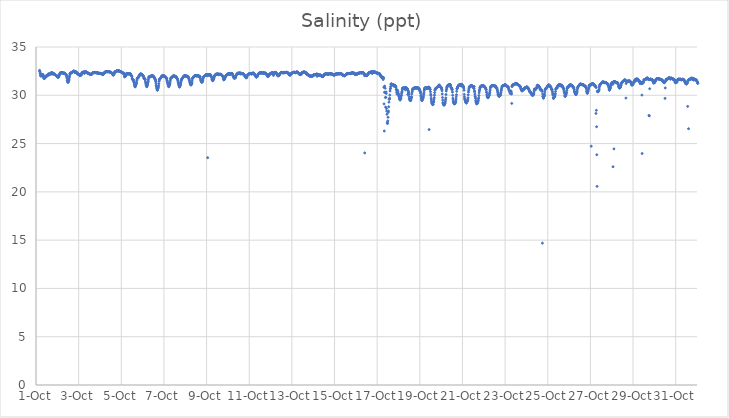
| Category | Salinity (ppt) |
|---|---|
| 44835.166666666664 | 32.58 |
| 44835.177083333336 | 32.49 |
| 44835.1875 | 32.41 |
| 44835.197916666664 | 32.23 |
| 44835.208333333336 | 32.07 |
| 44835.21875 | 32.02 |
| 44835.229166666664 | 32 |
| 44835.239583333336 | 32.01 |
| 44835.25 | 32.21 |
| 44835.260416666664 | 32.12 |
| 44835.270833333336 | 32 |
| 44835.28125 | 32.09 |
| 44835.291666666664 | 32.06 |
| 44835.302083333336 | 32.12 |
| 44835.3125 | 32.13 |
| 44835.322916666664 | 32.15 |
| 44835.333333333336 | 32.03 |
| 44835.34375 | 32.04 |
| 44835.354166666664 | 31.89 |
| 44835.364583333336 | 31.79 |
| 44835.375 | 31.74 |
| 44835.385416666664 | 31.87 |
| 44835.395833333336 | 31.84 |
| 44835.40625 | 31.77 |
| 44835.416666666664 | 31.77 |
| 44835.427083333336 | 31.86 |
| 44835.4375 | 31.91 |
| 44835.447916666664 | 31.94 |
| 44835.458333333336 | 31.96 |
| 44835.46875 | 32 |
| 44835.479166666664 | 31.99 |
| 44835.489583333336 | 32 |
| 44835.5 | 32 |
| 44835.510416666664 | 32.01 |
| 44835.520833333336 | 32.01 |
| 44835.53125 | 32.02 |
| 44835.541666666664 | 32.06 |
| 44835.552083333336 | 32.11 |
| 44835.5625 | 32.16 |
| 44835.572916666664 | 32.2 |
| 44835.583333333336 | 32.2 |
| 44835.59375 | 32.19 |
| 44835.604166666664 | 32.15 |
| 44835.614583333336 | 32.11 |
| 44835.625 | 32.14 |
| 44835.635416666664 | 32.16 |
| 44835.645833333336 | 32.18 |
| 44835.65625 | 32.2 |
| 44835.666666666664 | 32.24 |
| 44835.677083333336 | 32.25 |
| 44835.6875 | 32.28 |
| 44835.697916666664 | 32.29 |
| 44835.708333333336 | 32.31 |
| 44835.71875 | 32.31 |
| 44835.729166666664 | 32.33 |
| 44835.739583333336 | 32.33 |
| 44835.75 | 32.19 |
| 44835.760416666664 | 32.21 |
| 44835.770833333336 | 32.33 |
| 44835.78125 | 32.32 |
| 44835.791666666664 | 32.23 |
| 44835.802083333336 | 32.24 |
| 44835.8125 | 32.24 |
| 44835.822916666664 | 32.23 |
| 44835.833333333336 | 32.21 |
| 44835.84375 | 32.19 |
| 44835.854166666664 | 32.21 |
| 44835.864583333336 | 32.19 |
| 44835.875 | 32.19 |
| 44835.885416666664 | 32.16 |
| 44835.895833333336 | 32.13 |
| 44835.90625 | 32.12 |
| 44835.916666666664 | 32.09 |
| 44835.927083333336 | 32.08 |
| 44835.9375 | 32.07 |
| 44835.947916666664 | 32.04 |
| 44835.958333333336 | 32.03 |
| 44835.96875 | 32.03 |
| 44835.979166666664 | 32.02 |
| 44835.989583333336 | 31.98 |
| 44836.0 | 31.93 |
| 44836.010416666664 | 31.91 |
| 44836.020833333336 | 31.89 |
| 44836.03125 | 31.83 |
| 44836.041666666664 | 31.92 |
| 44836.052083333336 | 31.92 |
| 44836.0625 | 31.92 |
| 44836.072916666664 | 31.98 |
| 44836.083333333336 | 32.04 |
| 44836.09375 | 32.09 |
| 44836.104166666664 | 32.15 |
| 44836.114583333336 | 32.24 |
| 44836.125 | 32.29 |
| 44836.135416666664 | 32.3 |
| 44836.145833333336 | 32.33 |
| 44836.15625 | 32.33 |
| 44836.166666666664 | 32.33 |
| 44836.177083333336 | 32.33 |
| 44836.1875 | 32.33 |
| 44836.197916666664 | 32.32 |
| 44836.208333333336 | 32.32 |
| 44836.21875 | 32.33 |
| 44836.229166666664 | 32.33 |
| 44836.239583333336 | 32.33 |
| 44836.25 | 32.32 |
| 44836.260416666664 | 32.3 |
| 44836.270833333336 | 32.31 |
| 44836.28125 | 32.3 |
| 44836.291666666664 | 32.3 |
| 44836.302083333336 | 32.3 |
| 44836.3125 | 32.28 |
| 44836.322916666664 | 32.28 |
| 44836.333333333336 | 32.3 |
| 44836.34375 | 32.27 |
| 44836.354166666664 | 32.25 |
| 44836.364583333336 | 32.24 |
| 44836.375 | 32.23 |
| 44836.385416666664 | 32.17 |
| 44836.395833333336 | 32.17 |
| 44836.40625 | 32.14 |
| 44836.416666666664 | 32.11 |
| 44836.427083333336 | 32.03 |
| 44836.4375 | 31.97 |
| 44836.447916666664 | 31.86 |
| 44836.458333333336 | 31.72 |
| 44836.46875 | 31.53 |
| 44836.479166666664 | 31.45 |
| 44836.489583333336 | 31.36 |
| 44836.5 | 31.34 |
| 44836.510416666664 | 31.36 |
| 44836.520833333336 | 31.44 |
| 44836.53125 | 31.49 |
| 44836.541666666664 | 31.55 |
| 44836.552083333336 | 31.67 |
| 44836.5625 | 31.83 |
| 44836.572916666664 | 31.97 |
| 44836.583333333336 | 32.1 |
| 44836.59375 | 32.27 |
| 44836.604166666664 | 32.26 |
| 44836.614583333336 | 32.28 |
| 44836.625 | 32.3 |
| 44836.635416666664 | 32.31 |
| 44836.645833333336 | 32.32 |
| 44836.65625 | 32.33 |
| 44836.666666666664 | 32.33 |
| 44836.677083333336 | 32.34 |
| 44836.6875 | 32.36 |
| 44836.697916666664 | 32.38 |
| 44836.708333333336 | 32.41 |
| 44836.71875 | 32.45 |
| 44836.729166666664 | 32.46 |
| 44836.739583333336 | 32.46 |
| 44836.75 | 32.48 |
| 44836.760416666664 | 32.5 |
| 44836.770833333336 | 32.5 |
| 44836.78125 | 32.5 |
| 44836.791666666664 | 32.5 |
| 44836.802083333336 | 32.38 |
| 44836.8125 | 32.38 |
| 44836.822916666664 | 32.4 |
| 44836.833333333336 | 32.43 |
| 44836.84375 | 32.42 |
| 44836.854166666664 | 32.41 |
| 44836.864583333336 | 32.41 |
| 44836.875 | 32.42 |
| 44836.885416666664 | 32.42 |
| 44836.895833333336 | 32.36 |
| 44836.90625 | 32.34 |
| 44836.916666666664 | 32.31 |
| 44836.927083333336 | 32.28 |
| 44836.9375 | 32.25 |
| 44836.947916666664 | 32.21 |
| 44836.958333333336 | 32.21 |
| 44836.96875 | 32.2 |
| 44836.979166666664 | 32.18 |
| 44836.989583333336 | 32.2 |
| 44837.0 | 32.19 |
| 44837.010416666664 | 32.16 |
| 44837.020833333336 | 32.15 |
| 44837.03125 | 32.13 |
| 44837.041666666664 | 32.13 |
| 44837.052083333336 | 32.04 |
| 44837.0625 | 32.03 |
| 44837.072916666664 | 32.05 |
| 44837.083333333336 | 32.1 |
| 44837.09375 | 32.09 |
| 44837.104166666664 | 32.1 |
| 44837.114583333336 | 32.09 |
| 44837.125 | 32.13 |
| 44837.135416666664 | 32.18 |
| 44837.145833333336 | 32.26 |
| 44837.15625 | 32.33 |
| 44837.166666666664 | 32.35 |
| 44837.177083333336 | 32.36 |
| 44837.1875 | 32.37 |
| 44837.197916666664 | 32.39 |
| 44837.208333333336 | 32.38 |
| 44837.21875 | 32.38 |
| 44837.229166666664 | 32.38 |
| 44837.239583333336 | 32.4 |
| 44837.25 | 32.4 |
| 44837.260416666664 | 32.41 |
| 44837.270833333336 | 32.26 |
| 44837.28125 | 32.42 |
| 44837.291666666664 | 32.43 |
| 44837.302083333336 | 32.44 |
| 44837.3125 | 32.4 |
| 44837.322916666664 | 32.41 |
| 44837.333333333336 | 32.42 |
| 44837.34375 | 32.42 |
| 44837.354166666664 | 32.42 |
| 44837.364583333336 | 32.41 |
| 44837.375 | 32.38 |
| 44837.385416666664 | 32.36 |
| 44837.395833333336 | 32.33 |
| 44837.40625 | 32.32 |
| 44837.416666666664 | 32.31 |
| 44837.427083333336 | 32.3 |
| 44837.4375 | 32.3 |
| 44837.447916666664 | 32.29 |
| 44837.458333333336 | 32.28 |
| 44837.46875 | 32.25 |
| 44837.479166666664 | 32.24 |
| 44837.489583333336 | 32.25 |
| 44837.5 | 32.23 |
| 44837.510416666664 | 32.22 |
| 44837.520833333336 | 32.22 |
| 44837.53125 | 32.21 |
| 44837.541666666664 | 32.16 |
| 44837.552083333336 | 32.16 |
| 44837.5625 | 32.16 |
| 44837.572916666664 | 32.17 |
| 44837.583333333336 | 32.17 |
| 44837.59375 | 32.17 |
| 44837.604166666664 | 32.16 |
| 44837.614583333336 | 32.18 |
| 44837.625 | 32.22 |
| 44837.635416666664 | 32.25 |
| 44837.645833333336 | 32.28 |
| 44837.65625 | 32.31 |
| 44837.666666666664 | 32.33 |
| 44837.677083333336 | 32.34 |
| 44837.6875 | 32.34 |
| 44837.697916666664 | 32.35 |
| 44837.708333333336 | 32.35 |
| 44837.71875 | 32.35 |
| 44837.729166666664 | 32.36 |
| 44837.739583333336 | 32.35 |
| 44837.75 | 32.35 |
| 44837.760416666664 | 32.35 |
| 44837.770833333336 | 32.35 |
| 44837.78125 | 32.35 |
| 44837.791666666664 | 32.35 |
| 44837.802083333336 | 32.35 |
| 44837.8125 | 32.35 |
| 44837.822916666664 | 32.33 |
| 44837.833333333336 | 32.33 |
| 44837.84375 | 32.34 |
| 44837.854166666664 | 32.34 |
| 44837.864583333336 | 32.34 |
| 44837.875 | 32.33 |
| 44837.885416666664 | 32.31 |
| 44837.895833333336 | 32.3 |
| 44837.90625 | 32.29 |
| 44837.916666666664 | 32.29 |
| 44837.927083333336 | 32.28 |
| 44837.9375 | 32.29 |
| 44837.947916666664 | 32.28 |
| 44837.958333333336 | 32.27 |
| 44837.96875 | 32.28 |
| 44837.979166666664 | 32.27 |
| 44837.989583333336 | 32.26 |
| 44838.0 | 32.25 |
| 44838.010416666664 | 32.26 |
| 44838.020833333336 | 32.26 |
| 44838.03125 | 32.26 |
| 44838.041666666664 | 32.25 |
| 44838.052083333336 | 32.26 |
| 44838.0625 | 32.25 |
| 44838.072916666664 | 32.26 |
| 44838.083333333336 | 32.23 |
| 44838.09375 | 32.21 |
| 44838.104166666664 | 32.22 |
| 44838.114583333336 | 32.17 |
| 44838.125 | 32.14 |
| 44838.135416666664 | 32.14 |
| 44838.145833333336 | 32.18 |
| 44838.15625 | 32.17 |
| 44838.166666666664 | 32.19 |
| 44838.177083333336 | 32.22 |
| 44838.1875 | 32.27 |
| 44838.197916666664 | 32.32 |
| 44838.208333333336 | 32.34 |
| 44838.21875 | 32.38 |
| 44838.229166666664 | 32.38 |
| 44838.239583333336 | 32.41 |
| 44838.25 | 32.42 |
| 44838.260416666664 | 32.42 |
| 44838.270833333336 | 32.43 |
| 44838.28125 | 32.44 |
| 44838.291666666664 | 32.44 |
| 44838.302083333336 | 32.45 |
| 44838.3125 | 32.45 |
| 44838.322916666664 | 32.46 |
| 44838.333333333336 | 32.45 |
| 44838.34375 | 32.45 |
| 44838.354166666664 | 32.45 |
| 44838.364583333336 | 32.43 |
| 44838.375 | 32.44 |
| 44838.385416666664 | 32.45 |
| 44838.395833333336 | 32.45 |
| 44838.40625 | 32.45 |
| 44838.416666666664 | 32.44 |
| 44838.427083333336 | 32.44 |
| 44838.4375 | 32.43 |
| 44838.447916666664 | 32.43 |
| 44838.458333333336 | 32.43 |
| 44838.46875 | 32.42 |
| 44838.479166666664 | 32.39 |
| 44838.489583333336 | 32.38 |
| 44838.5 | 32.39 |
| 44838.510416666664 | 32.34 |
| 44838.520833333336 | 32.37 |
| 44838.53125 | 32.33 |
| 44838.541666666664 | 32.32 |
| 44838.552083333336 | 32.29 |
| 44838.5625 | 32.29 |
| 44838.572916666664 | 32.26 |
| 44838.583333333336 | 32.24 |
| 44838.59375 | 32.23 |
| 44838.604166666664 | 32.18 |
| 44838.614583333336 | 32.11 |
| 44838.625 | 32.07 |
| 44838.635416666664 | 32.18 |
| 44838.645833333336 | 32.16 |
| 44838.65625 | 32.19 |
| 44838.666666666664 | 32.25 |
| 44838.677083333336 | 32.28 |
| 44838.6875 | 32.38 |
| 44838.697916666664 | 32.44 |
| 44838.708333333336 | 32.45 |
| 44838.71875 | 32.45 |
| 44838.729166666664 | 32.46 |
| 44838.739583333336 | 32.46 |
| 44838.75 | 32.48 |
| 44838.760416666664 | 32.49 |
| 44838.770833333336 | 32.51 |
| 44838.78125 | 32.52 |
| 44838.791666666664 | 32.52 |
| 44838.802083333336 | 32.53 |
| 44838.8125 | 32.53 |
| 44838.822916666664 | 32.53 |
| 44838.833333333336 | 32.53 |
| 44838.84375 | 32.53 |
| 44838.854166666664 | 32.52 |
| 44838.864583333336 | 32.52 |
| 44838.875 | 32.52 |
| 44838.885416666664 | 32.53 |
| 44838.895833333336 | 32.52 |
| 44838.90625 | 32.5 |
| 44838.916666666664 | 32.5 |
| 44838.927083333336 | 32.5 |
| 44838.9375 | 32.48 |
| 44838.947916666664 | 32.46 |
| 44838.958333333336 | 32.44 |
| 44838.96875 | 32.44 |
| 44838.979166666664 | 32.44 |
| 44838.989583333336 | 32.44 |
| 44839.0 | 32.44 |
| 44839.010416666664 | 32.41 |
| 44839.020833333336 | 32.39 |
| 44839.03125 | 32.36 |
| 44839.041666666664 | 32.34 |
| 44839.052083333336 | 32.34 |
| 44839.0625 | 32.33 |
| 44839.072916666664 | 32.31 |
| 44839.083333333336 | 32.3 |
| 44839.09375 | 32.29 |
| 44839.104166666664 | 32.27 |
| 44839.114583333336 | 32.25 |
| 44839.125 | 32.27 |
| 44839.135416666664 | 32.19 |
| 44839.145833333336 | 32.02 |
| 44839.15625 | 31.91 |
| 44839.166666666664 | 31.91 |
| 44839.177083333336 | 31.95 |
| 44839.1875 | 31.98 |
| 44839.197916666664 | 31.98 |
| 44839.208333333336 | 32.03 |
| 44839.21875 | 32.07 |
| 44839.229166666664 | 32.17 |
| 44839.239583333336 | 32.22 |
| 44839.25 | 32.26 |
| 44839.260416666664 | 32.27 |
| 44839.270833333336 | 32.26 |
| 44839.28125 | 32.24 |
| 44839.291666666664 | 32.23 |
| 44839.302083333336 | 32.22 |
| 44839.3125 | 32.22 |
| 44839.322916666664 | 32.22 |
| 44839.333333333336 | 32.22 |
| 44839.34375 | 32.23 |
| 44839.354166666664 | 32.23 |
| 44839.364583333336 | 32.24 |
| 44839.375 | 32.24 |
| 44839.385416666664 | 32.24 |
| 44839.395833333336 | 32.23 |
| 44839.40625 | 32.21 |
| 44839.416666666664 | 32.23 |
| 44839.427083333336 | 32.23 |
| 44839.4375 | 32.17 |
| 44839.447916666664 | 32.1 |
| 44839.458333333336 | 32.08 |
| 44839.46875 | 32.04 |
| 44839.479166666664 | 32.03 |
| 44839.489583333336 | 32 |
| 44839.5 | 31.94 |
| 44839.510416666664 | 31.73 |
| 44839.520833333336 | 31.69 |
| 44839.53125 | 31.63 |
| 44839.541666666664 | 31.62 |
| 44839.552083333336 | 31.62 |
| 44839.5625 | 31.6 |
| 44839.572916666664 | 31.54 |
| 44839.583333333336 | 31.45 |
| 44839.59375 | 31.36 |
| 44839.604166666664 | 31.31 |
| 44839.614583333336 | 31.14 |
| 44839.625 | 31.02 |
| 44839.635416666664 | 30.93 |
| 44839.645833333336 | 30.87 |
| 44839.65625 | 30.89 |
| 44839.666666666664 | 31.02 |
| 44839.677083333336 | 31.08 |
| 44839.6875 | 31.1 |
| 44839.697916666664 | 31.16 |
| 44839.708333333336 | 31.24 |
| 44839.71875 | 31.37 |
| 44839.729166666664 | 31.56 |
| 44839.739583333336 | 31.7 |
| 44839.75 | 31.75 |
| 44839.760416666664 | 31.76 |
| 44839.770833333336 | 31.78 |
| 44839.78125 | 31.79 |
| 44839.791666666664 | 31.84 |
| 44839.802083333336 | 31.86 |
| 44839.8125 | 31.9 |
| 44839.822916666664 | 31.95 |
| 44839.833333333336 | 32.01 |
| 44839.84375 | 32.03 |
| 44839.854166666664 | 32.08 |
| 44839.864583333336 | 32.14 |
| 44839.875 | 32.17 |
| 44839.885416666664 | 32.19 |
| 44839.895833333336 | 32.2 |
| 44839.90625 | 32.21 |
| 44839.916666666664 | 32.21 |
| 44839.927083333336 | 32.21 |
| 44839.9375 | 32.18 |
| 44839.947916666664 | 32.12 |
| 44839.958333333336 | 32.16 |
| 44839.96875 | 32.12 |
| 44839.979166666664 | 32.1 |
| 44839.989583333336 | 32.08 |
| 44840.0 | 32.08 |
| 44840.010416666664 | 32.07 |
| 44840.020833333336 | 32.04 |
| 44840.03125 | 32.01 |
| 44840.041666666664 | 31.94 |
| 44840.052083333336 | 31.85 |
| 44840.0625 | 31.77 |
| 44840.072916666664 | 31.74 |
| 44840.083333333336 | 31.72 |
| 44840.09375 | 31.73 |
| 44840.104166666664 | 31.7 |
| 44840.114583333336 | 31.67 |
| 44840.125 | 31.6 |
| 44840.135416666664 | 31.4 |
| 44840.145833333336 | 31.27 |
| 44840.15625 | 31.16 |
| 44840.166666666664 | 31.06 |
| 44840.177083333336 | 30.97 |
| 44840.1875 | 30.9 |
| 44840.197916666664 | 30.89 |
| 44840.208333333336 | 30.99 |
| 44840.21875 | 31.05 |
| 44840.229166666664 | 31.09 |
| 44840.239583333336 | 31.17 |
| 44840.25 | 31.33 |
| 44840.260416666664 | 31.44 |
| 44840.270833333336 | 31.59 |
| 44840.28125 | 31.77 |
| 44840.291666666664 | 31.9 |
| 44840.302083333336 | 31.91 |
| 44840.3125 | 31.91 |
| 44840.322916666664 | 31.91 |
| 44840.333333333336 | 31.9 |
| 44840.34375 | 31.91 |
| 44840.354166666664 | 31.93 |
| 44840.364583333336 | 31.94 |
| 44840.375 | 31.96 |
| 44840.385416666664 | 31.97 |
| 44840.395833333336 | 31.99 |
| 44840.40625 | 32 |
| 44840.416666666664 | 32.02 |
| 44840.427083333336 | 32.04 |
| 44840.4375 | 32.06 |
| 44840.447916666664 | 32.05 |
| 44840.458333333336 | 31.98 |
| 44840.46875 | 32.03 |
| 44840.479166666664 | 32 |
| 44840.489583333336 | 31.97 |
| 44840.5 | 31.98 |
| 44840.510416666664 | 31.94 |
| 44840.520833333336 | 31.93 |
| 44840.53125 | 31.88 |
| 44840.541666666664 | 31.86 |
| 44840.552083333336 | 31.83 |
| 44840.5625 | 31.77 |
| 44840.572916666664 | 31.72 |
| 44840.583333333336 | 31.68 |
| 44840.59375 | 31.63 |
| 44840.604166666664 | 31.56 |
| 44840.614583333336 | 31.42 |
| 44840.625 | 31.24 |
| 44840.635416666664 | 31.04 |
| 44840.645833333336 | 30.88 |
| 44840.65625 | 30.89 |
| 44840.666666666664 | 30.69 |
| 44840.677083333336 | 30.64 |
| 44840.6875 | 30.53 |
| 44840.697916666664 | 30.53 |
| 44840.708333333336 | 30.67 |
| 44840.71875 | 30.73 |
| 44840.729166666664 | 30.77 |
| 44840.739583333336 | 30.87 |
| 44840.75 | 31 |
| 44840.760416666664 | 31.2 |
| 44840.770833333336 | 31.44 |
| 44840.78125 | 31.6 |
| 44840.791666666664 | 31.62 |
| 44840.802083333336 | 31.67 |
| 44840.8125 | 31.7 |
| 44840.822916666664 | 31.75 |
| 44840.833333333336 | 31.76 |
| 44840.84375 | 31.79 |
| 44840.854166666664 | 31.82 |
| 44840.864583333336 | 31.85 |
| 44840.875 | 31.89 |
| 44840.885416666664 | 31.94 |
| 44840.895833333336 | 31.97 |
| 44840.90625 | 31.99 |
| 44840.916666666664 | 32.01 |
| 44840.927083333336 | 32.02 |
| 44840.9375 | 32.04 |
| 44840.947916666664 | 32.04 |
| 44840.958333333336 | 32.04 |
| 44840.96875 | 32.05 |
| 44840.979166666664 | 32.03 |
| 44840.989583333336 | 31.99 |
| 44841.0 | 31.94 |
| 44841.010416666664 | 31.99 |
| 44841.020833333336 | 31.97 |
| 44841.03125 | 31.99 |
| 44841.041666666664 | 31.95 |
| 44841.052083333336 | 31.96 |
| 44841.0625 | 31.94 |
| 44841.072916666664 | 31.9 |
| 44841.083333333336 | 31.86 |
| 44841.09375 | 31.82 |
| 44841.104166666664 | 31.78 |
| 44841.114583333336 | 31.77 |
| 44841.125 | 31.75 |
| 44841.135416666664 | 31.69 |
| 44841.145833333336 | 31.54 |
| 44841.15625 | 31.45 |
| 44841.166666666664 | 31.35 |
| 44841.177083333336 | 31.24 |
| 44841.1875 | 31.15 |
| 44841.197916666664 | 31.07 |
| 44841.208333333336 | 30.98 |
| 44841.21875 | 30.9 |
| 44841.229166666664 | 30.89 |
| 44841.239583333336 | 30.98 |
| 44841.25 | 31.06 |
| 44841.260416666664 | 31.06 |
| 44841.270833333336 | 31.14 |
| 44841.28125 | 31.27 |
| 44841.291666666664 | 31.37 |
| 44841.302083333336 | 31.56 |
| 44841.3125 | 31.72 |
| 44841.322916666664 | 31.78 |
| 44841.333333333336 | 31.79 |
| 44841.34375 | 31.81 |
| 44841.354166666664 | 31.83 |
| 44841.364583333336 | 31.85 |
| 44841.375 | 31.87 |
| 44841.385416666664 | 31.89 |
| 44841.395833333336 | 31.92 |
| 44841.40625 | 31.94 |
| 44841.416666666664 | 31.97 |
| 44841.427083333336 | 31.99 |
| 44841.4375 | 32 |
| 44841.447916666664 | 32.01 |
| 44841.458333333336 | 32.02 |
| 44841.46875 | 32.02 |
| 44841.479166666664 | 31.98 |
| 44841.489583333336 | 31.97 |
| 44841.5 | 31.98 |
| 44841.510416666664 | 31.96 |
| 44841.520833333336 | 31.95 |
| 44841.53125 | 31.97 |
| 44841.541666666664 | 31.94 |
| 44841.552083333336 | 31.92 |
| 44841.5625 | 31.94 |
| 44841.572916666664 | 31.87 |
| 44841.583333333336 | 31.87 |
| 44841.59375 | 31.82 |
| 44841.604166666664 | 31.78 |
| 44841.614583333336 | 31.73 |
| 44841.625 | 31.71 |
| 44841.635416666664 | 31.68 |
| 44841.645833333336 | 31.58 |
| 44841.65625 | 31.49 |
| 44841.666666666664 | 31.36 |
| 44841.677083333336 | 31.31 |
| 44841.6875 | 31.16 |
| 44841.697916666664 | 31.08 |
| 44841.708333333336 | 31.01 |
| 44841.71875 | 30.94 |
| 44841.729166666664 | 30.84 |
| 44841.739583333336 | 30.91 |
| 44841.75 | 31.03 |
| 44841.760416666664 | 30.97 |
| 44841.770833333336 | 31.07 |
| 44841.78125 | 31.19 |
| 44841.791666666664 | 31.29 |
| 44841.802083333336 | 31.45 |
| 44841.8125 | 31.55 |
| 44841.822916666664 | 31.63 |
| 44841.833333333336 | 31.67 |
| 44841.84375 | 31.7 |
| 44841.854166666664 | 31.75 |
| 44841.864583333336 | 31.77 |
| 44841.875 | 31.79 |
| 44841.885416666664 | 31.83 |
| 44841.895833333336 | 31.85 |
| 44841.90625 | 31.9 |
| 44841.916666666664 | 31.93 |
| 44841.927083333336 | 31.97 |
| 44841.9375 | 31.99 |
| 44841.947916666664 | 32 |
| 44841.958333333336 | 32.01 |
| 44841.96875 | 32.02 |
| 44841.979166666664 | 32.03 |
| 44841.989583333336 | 32.04 |
| 44842.0 | 32.04 |
| 44842.010416666664 | 32 |
| 44842.020833333336 | 31.97 |
| 44842.03125 | 32 |
| 44842.041666666664 | 31.98 |
| 44842.052083333336 | 31.97 |
| 44842.0625 | 31.99 |
| 44842.072916666664 | 31.97 |
| 44842.083333333336 | 31.97 |
| 44842.09375 | 31.97 |
| 44842.104166666664 | 31.95 |
| 44842.114583333336 | 31.91 |
| 44842.125 | 31.89 |
| 44842.135416666664 | 31.88 |
| 44842.145833333336 | 31.89 |
| 44842.15625 | 31.83 |
| 44842.166666666664 | 31.78 |
| 44842.177083333336 | 31.71 |
| 44842.1875 | 31.62 |
| 44842.197916666664 | 31.52 |
| 44842.208333333336 | 31.42 |
| 44842.21875 | 31.34 |
| 44842.229166666664 | 31.24 |
| 44842.239583333336 | 31.16 |
| 44842.25 | 31.13 |
| 44842.260416666664 | 31.07 |
| 44842.270833333336 | 31.06 |
| 44842.28125 | 31.17 |
| 44842.291666666664 | 31.13 |
| 44842.302083333336 | 31.22 |
| 44842.3125 | 31.3 |
| 44842.322916666664 | 31.5 |
| 44842.333333333336 | 31.7 |
| 44842.34375 | 31.78 |
| 44842.354166666664 | 31.79 |
| 44842.364583333336 | 31.83 |
| 44842.375 | 31.85 |
| 44842.385416666664 | 31.88 |
| 44842.395833333336 | 31.91 |
| 44842.40625 | 31.94 |
| 44842.416666666664 | 31.97 |
| 44842.427083333336 | 31.99 |
| 44842.4375 | 32.01 |
| 44842.447916666664 | 32.02 |
| 44842.458333333336 | 32.03 |
| 44842.46875 | 32.04 |
| 44842.479166666664 | 32.04 |
| 44842.489583333336 | 32.04 |
| 44842.5 | 32.04 |
| 44842.510416666664 | 32.04 |
| 44842.520833333336 | 32.04 |
| 44842.53125 | 31.97 |
| 44842.541666666664 | 32.03 |
| 44842.552083333336 | 32.02 |
| 44842.5625 | 32.01 |
| 44842.572916666664 | 32.03 |
| 44842.583333333336 | 32.02 |
| 44842.59375 | 32.02 |
| 44842.604166666664 | 32.02 |
| 44842.614583333336 | 32.01 |
| 44842.625 | 32 |
| 44842.635416666664 | 31.98 |
| 44842.645833333336 | 31.96 |
| 44842.65625 | 31.97 |
| 44842.666666666664 | 31.97 |
| 44842.677083333336 | 31.91 |
| 44842.6875 | 31.94 |
| 44842.697916666664 | 31.91 |
| 44842.708333333336 | 31.75 |
| 44842.71875 | 31.68 |
| 44842.729166666664 | 31.56 |
| 44842.739583333336 | 31.5 |
| 44842.75 | 31.42 |
| 44842.760416666664 | 31.43 |
| 44842.770833333336 | 31.33 |
| 44842.78125 | 31.39 |
| 44842.791666666664 | 31.43 |
| 44842.802083333336 | 31.4 |
| 44842.8125 | 31.46 |
| 44842.822916666664 | 31.49 |
| 44842.833333333336 | 31.69 |
| 44842.84375 | 31.81 |
| 44842.854166666664 | 31.87 |
| 44842.864583333336 | 31.9 |
| 44842.875 | 31.93 |
| 44842.885416666664 | 31.96 |
| 44842.895833333336 | 31.97 |
| 44842.90625 | 32.01 |
| 44842.916666666664 | 32.04 |
| 44842.927083333336 | 32.05 |
| 44842.9375 | 32.08 |
| 44842.947916666664 | 32.09 |
| 44842.958333333336 | 32.1 |
| 44842.96875 | 32.11 |
| 44842.979166666664 | 32.11 |
| 44842.989583333336 | 32.11 |
| 44843.0 | 32.12 |
| 44843.010416666664 | 32.13 |
| 44843.020833333336 | 32.13 |
| 44843.03125 | 32.14 |
| 44843.041666666664 | 32.03 |
| 44843.052083333336 | 23.54 |
| 44843.0625 | 32.09 |
| 44843.072916666664 | 32.09 |
| 44843.083333333336 | 32.1 |
| 44843.09375 | 32.12 |
| 44843.104166666664 | 32.1 |
| 44843.114583333336 | 32.11 |
| 44843.125 | 32.13 |
| 44843.135416666664 | 32.1 |
| 44843.145833333336 | 32.13 |
| 44843.15625 | 32.14 |
| 44843.166666666664 | 32.14 |
| 44843.177083333336 | 32.13 |
| 44843.1875 | 32.12 |
| 44843.197916666664 | 32.05 |
| 44843.208333333336 | 31.97 |
| 44843.21875 | 31.94 |
| 44843.229166666664 | 31.86 |
| 44843.239583333336 | 31.87 |
| 44843.25 | 31.68 |
| 44843.260416666664 | 31.61 |
| 44843.270833333336 | 31.56 |
| 44843.28125 | 31.53 |
| 44843.291666666664 | 31.51 |
| 44843.302083333336 | 31.62 |
| 44843.3125 | 31.62 |
| 44843.322916666664 | 31.62 |
| 44843.333333333336 | 31.7 |
| 44843.34375 | 31.78 |
| 44843.354166666664 | 31.88 |
| 44843.364583333336 | 31.99 |
| 44843.375 | 32.03 |
| 44843.385416666664 | 32.06 |
| 44843.395833333336 | 32.09 |
| 44843.40625 | 32.1 |
| 44843.416666666664 | 32.13 |
| 44843.427083333336 | 32.15 |
| 44843.4375 | 32.18 |
| 44843.447916666664 | 32.19 |
| 44843.458333333336 | 32.19 |
| 44843.46875 | 32.19 |
| 44843.479166666664 | 32.18 |
| 44843.489583333336 | 32.18 |
| 44843.5 | 32.19 |
| 44843.510416666664 | 32.19 |
| 44843.520833333336 | 32.19 |
| 44843.53125 | 32.2 |
| 44843.541666666664 | 32.2 |
| 44843.552083333336 | 32.2 |
| 44843.5625 | 32.13 |
| 44843.572916666664 | 32.16 |
| 44843.583333333336 | 32.16 |
| 44843.59375 | 32.16 |
| 44843.604166666664 | 32.19 |
| 44843.614583333336 | 32.15 |
| 44843.625 | 32.16 |
| 44843.635416666664 | 32.18 |
| 44843.645833333336 | 32.18 |
| 44843.65625 | 32.16 |
| 44843.666666666664 | 32.14 |
| 44843.677083333336 | 32.16 |
| 44843.6875 | 32.13 |
| 44843.697916666664 | 32.12 |
| 44843.708333333336 | 32.12 |
| 44843.71875 | 32.07 |
| 44843.729166666664 | 32.05 |
| 44843.739583333336 | 32 |
| 44843.75 | 31.97 |
| 44843.760416666664 | 31.94 |
| 44843.770833333336 | 31.93 |
| 44843.78125 | 31.8 |
| 44843.791666666664 | 31.72 |
| 44843.802083333336 | 31.61 |
| 44843.8125 | 31.6 |
| 44843.822916666664 | 31.73 |
| 44843.833333333336 | 31.64 |
| 44843.84375 | 31.68 |
| 44843.854166666664 | 31.74 |
| 44843.864583333336 | 31.85 |
| 44843.875 | 31.91 |
| 44843.885416666664 | 31.95 |
| 44843.895833333336 | 31.97 |
| 44843.90625 | 32 |
| 44843.916666666664 | 32.04 |
| 44843.927083333336 | 32.06 |
| 44843.9375 | 32.09 |
| 44843.947916666664 | 32.11 |
| 44843.958333333336 | 32.14 |
| 44843.96875 | 32.17 |
| 44843.979166666664 | 32.18 |
| 44843.989583333336 | 32.19 |
| 44844.0 | 32.19 |
| 44844.010416666664 | 32.2 |
| 44844.020833333336 | 32.21 |
| 44844.03125 | 32.22 |
| 44844.041666666664 | 32.23 |
| 44844.052083333336 | 32.24 |
| 44844.0625 | 32.25 |
| 44844.072916666664 | 32.16 |
| 44844.083333333336 | 32.2 |
| 44844.09375 | 32.21 |
| 44844.104166666664 | 32.2 |
| 44844.114583333336 | 32.23 |
| 44844.125 | 32.2 |
| 44844.135416666664 | 32.21 |
| 44844.145833333336 | 32.24 |
| 44844.15625 | 32.24 |
| 44844.166666666664 | 32.27 |
| 44844.177083333336 | 32.25 |
| 44844.1875 | 32.22 |
| 44844.197916666664 | 32.25 |
| 44844.208333333336 | 32.24 |
| 44844.21875 | 32.17 |
| 44844.229166666664 | 32.09 |
| 44844.239583333336 | 32.04 |
| 44844.25 | 31.97 |
| 44844.260416666664 | 31.99 |
| 44844.270833333336 | 31.84 |
| 44844.28125 | 31.85 |
| 44844.291666666664 | 31.79 |
| 44844.302083333336 | 31.76 |
| 44844.3125 | 31.77 |
| 44844.322916666664 | 31.79 |
| 44844.333333333336 | 31.84 |
| 44844.34375 | 31.8 |
| 44844.354166666664 | 31.83 |
| 44844.364583333336 | 31.89 |
| 44844.375 | 32 |
| 44844.385416666664 | 32.06 |
| 44844.395833333336 | 32.11 |
| 44844.40625 | 32.14 |
| 44844.416666666664 | 32.17 |
| 44844.427083333336 | 32.21 |
| 44844.4375 | 32.22 |
| 44844.447916666664 | 32.25 |
| 44844.458333333336 | 32.27 |
| 44844.46875 | 32.29 |
| 44844.479166666664 | 32.29 |
| 44844.489583333336 | 32.29 |
| 44844.5 | 32.3 |
| 44844.510416666664 | 32.29 |
| 44844.520833333336 | 32.29 |
| 44844.53125 | 32.28 |
| 44844.541666666664 | 32.29 |
| 44844.552083333336 | 32.29 |
| 44844.5625 | 32.3 |
| 44844.572916666664 | 32.3 |
| 44844.583333333336 | 32.31 |
| 44844.59375 | 32.2 |
| 44844.604166666664 | 32.26 |
| 44844.614583333336 | 32.24 |
| 44844.625 | 32.29 |
| 44844.635416666664 | 32.24 |
| 44844.645833333336 | 32.25 |
| 44844.65625 | 32.25 |
| 44844.666666666664 | 32.24 |
| 44844.677083333336 | 32.25 |
| 44844.6875 | 32.23 |
| 44844.697916666664 | 32.24 |
| 44844.708333333336 | 32.2 |
| 44844.71875 | 32.23 |
| 44844.729166666664 | 32.19 |
| 44844.739583333336 | 32.17 |
| 44844.75 | 32.16 |
| 44844.760416666664 | 32.12 |
| 44844.770833333336 | 32.1 |
| 44844.78125 | 32.05 |
| 44844.791666666664 | 32.03 |
| 44844.802083333336 | 31.95 |
| 44844.8125 | 31.95 |
| 44844.822916666664 | 31.91 |
| 44844.833333333336 | 31.89 |
| 44844.84375 | 31.81 |
| 44844.854166666664 | 31.96 |
| 44844.864583333336 | 31.82 |
| 44844.875 | 31.83 |
| 44844.885416666664 | 31.86 |
| 44844.895833333336 | 32 |
| 44844.90625 | 32.02 |
| 44844.916666666664 | 32.07 |
| 44844.927083333336 | 32.1 |
| 44844.9375 | 32.12 |
| 44844.947916666664 | 32.13 |
| 44844.958333333336 | 32.17 |
| 44844.96875 | 32.18 |
| 44844.979166666664 | 32.18 |
| 44844.989583333336 | 32.2 |
| 44845.0 | 32.22 |
| 44845.010416666664 | 32.25 |
| 44845.020833333336 | 32.25 |
| 44845.03125 | 32.26 |
| 44845.041666666664 | 32.26 |
| 44845.052083333336 | 32.26 |
| 44845.0625 | 32.26 |
| 44845.072916666664 | 32.26 |
| 44845.083333333336 | 32.27 |
| 44845.09375 | 32.27 |
| 44845.104166666664 | 32.18 |
| 44845.114583333336 | 32.22 |
| 44845.125 | 32.23 |
| 44845.135416666664 | 32.27 |
| 44845.145833333336 | 32.28 |
| 44845.15625 | 32.25 |
| 44845.166666666664 | 32.29 |
| 44845.177083333336 | 32.27 |
| 44845.1875 | 32.29 |
| 44845.197916666664 | 32.31 |
| 44845.208333333336 | 32.27 |
| 44845.21875 | 32.27 |
| 44845.229166666664 | 32.25 |
| 44845.239583333336 | 32.2 |
| 44845.25 | 32.15 |
| 44845.260416666664 | 32.13 |
| 44845.270833333336 | 32.08 |
| 44845.28125 | 32.04 |
| 44845.291666666664 | 32.04 |
| 44845.302083333336 | 32.01 |
| 44845.3125 | 31.95 |
| 44845.322916666664 | 31.9 |
| 44845.333333333336 | 31.87 |
| 44845.34375 | 31.9 |
| 44845.354166666664 | 31.95 |
| 44845.364583333336 | 31.92 |
| 44845.375 | 31.95 |
| 44845.385416666664 | 31.99 |
| 44845.395833333336 | 32.08 |
| 44845.40625 | 32.13 |
| 44845.416666666664 | 32.18 |
| 44845.427083333336 | 32.2 |
| 44845.4375 | 32.23 |
| 44845.447916666664 | 32.25 |
| 44845.458333333336 | 32.28 |
| 44845.46875 | 32.29 |
| 44845.479166666664 | 32.3 |
| 44845.489583333336 | 32.32 |
| 44845.5 | 32.33 |
| 44845.510416666664 | 32.34 |
| 44845.520833333336 | 32.33 |
| 44845.53125 | 32.32 |
| 44845.541666666664 | 32.31 |
| 44845.552083333336 | 32.31 |
| 44845.5625 | 32.31 |
| 44845.572916666664 | 32.31 |
| 44845.583333333336 | 32.32 |
| 44845.59375 | 32.33 |
| 44845.604166666664 | 32.34 |
| 44845.614583333336 | 32.33 |
| 44845.625 | 32.29 |
| 44845.635416666664 | 32.3 |
| 44845.645833333336 | 32.3 |
| 44845.65625 | 32.32 |
| 44845.666666666664 | 32.33 |
| 44845.677083333336 | 32.29 |
| 44845.6875 | 32.3 |
| 44845.697916666664 | 32.29 |
| 44845.708333333336 | 32.3 |
| 44845.71875 | 32.29 |
| 44845.729166666664 | 32.28 |
| 44845.739583333336 | 32.33 |
| 44845.75 | 32.29 |
| 44845.760416666664 | 32.27 |
| 44845.770833333336 | 32.26 |
| 44845.78125 | 32.25 |
| 44845.791666666664 | 32.22 |
| 44845.802083333336 | 32.22 |
| 44845.8125 | 32.17 |
| 44845.822916666664 | 32.12 |
| 44845.833333333336 | 32.09 |
| 44845.84375 | 32.02 |
| 44845.854166666664 | 31.99 |
| 44845.864583333336 | 31.94 |
| 44845.875 | 32.02 |
| 44845.885416666664 | 31.98 |
| 44845.895833333336 | 31.96 |
| 44845.90625 | 32 |
| 44845.916666666664 | 32.04 |
| 44845.927083333336 | 32.11 |
| 44845.9375 | 32.13 |
| 44845.947916666664 | 32.16 |
| 44845.958333333336 | 32.18 |
| 44845.96875 | 32.2 |
| 44845.979166666664 | 32.22 |
| 44845.989583333336 | 32.23 |
| 44846.0 | 32.25 |
| 44846.010416666664 | 32.27 |
| 44846.020833333336 | 32.28 |
| 44846.03125 | 32.29 |
| 44846.041666666664 | 32.31 |
| 44846.052083333336 | 32.32 |
| 44846.0625 | 32.32 |
| 44846.072916666664 | 32.33 |
| 44846.083333333336 | 32.33 |
| 44846.09375 | 32.33 |
| 44846.104166666664 | 32.32 |
| 44846.114583333336 | 32.32 |
| 44846.125 | 32.24 |
| 44846.135416666664 | 32.05 |
| 44846.145833333336 | 32.21 |
| 44846.15625 | 32.31 |
| 44846.166666666664 | 32.33 |
| 44846.177083333336 | 32.29 |
| 44846.1875 | 32.35 |
| 44846.197916666664 | 32.36 |
| 44846.208333333336 | 32.37 |
| 44846.21875 | 32.38 |
| 44846.229166666664 | 32.37 |
| 44846.239583333336 | 32.35 |
| 44846.25 | 32.33 |
| 44846.260416666664 | 32.33 |
| 44846.270833333336 | 32.28 |
| 44846.28125 | 32.24 |
| 44846.291666666664 | 32.24 |
| 44846.302083333336 | 32.15 |
| 44846.3125 | 32.1 |
| 44846.322916666664 | 32.14 |
| 44846.333333333336 | 32.03 |
| 44846.34375 | 32.02 |
| 44846.354166666664 | 32.04 |
| 44846.364583333336 | 32.01 |
| 44846.375 | 32.09 |
| 44846.385416666664 | 32.06 |
| 44846.395833333336 | 32.06 |
| 44846.40625 | 32.1 |
| 44846.416666666664 | 32.13 |
| 44846.427083333336 | 32.2 |
| 44846.4375 | 32.24 |
| 44846.447916666664 | 32.27 |
| 44846.458333333336 | 32.28 |
| 44846.46875 | 32.3 |
| 44846.479166666664 | 32.31 |
| 44846.489583333336 | 32.33 |
| 44846.5 | 32.34 |
| 44846.510416666664 | 32.36 |
| 44846.520833333336 | 32.36 |
| 44846.53125 | 32.36 |
| 44846.541666666664 | 32.37 |
| 44846.552083333336 | 32.36 |
| 44846.5625 | 32.35 |
| 44846.572916666664 | 32.32 |
| 44846.583333333336 | 32.33 |
| 44846.59375 | 32.33 |
| 44846.604166666664 | 32.34 |
| 44846.614583333336 | 32.33 |
| 44846.625 | 32.34 |
| 44846.635416666664 | 32.35 |
| 44846.645833333336 | 32.37 |
| 44846.65625 | 32.34 |
| 44846.666666666664 | 32.37 |
| 44846.677083333336 | 32.35 |
| 44846.6875 | 32.35 |
| 44846.697916666664 | 32.36 |
| 44846.708333333336 | 32.35 |
| 44846.71875 | 32.34 |
| 44846.729166666664 | 32.36 |
| 44846.739583333336 | 32.36 |
| 44846.75 | 32.4 |
| 44846.760416666664 | 32.37 |
| 44846.770833333336 | 32.35 |
| 44846.78125 | 32.34 |
| 44846.791666666664 | 32.35 |
| 44846.802083333336 | 32.33 |
| 44846.8125 | 32.32 |
| 44846.822916666664 | 32.31 |
| 44846.833333333336 | 32.29 |
| 44846.84375 | 32.24 |
| 44846.854166666664 | 32.23 |
| 44846.864583333336 | 32.18 |
| 44846.875 | 32.16 |
| 44846.885416666664 | 32.13 |
| 44846.895833333336 | 32.09 |
| 44846.90625 | 32.17 |
| 44846.916666666664 | 32.09 |
| 44846.927083333336 | 32.09 |
| 44846.9375 | 32.14 |
| 44846.947916666664 | 32.19 |
| 44846.958333333336 | 32.24 |
| 44846.96875 | 32.26 |
| 44846.979166666664 | 32.26 |
| 44846.989583333336 | 32.28 |
| 44847.0 | 32.3 |
| 44847.010416666664 | 32.31 |
| 44847.020833333336 | 32.32 |
| 44847.03125 | 32.33 |
| 44847.041666666664 | 32.34 |
| 44847.052083333336 | 32.35 |
| 44847.0625 | 32.37 |
| 44847.072916666664 | 32.37 |
| 44847.083333333336 | 32.38 |
| 44847.09375 | 32.38 |
| 44847.104166666664 | 32.38 |
| 44847.114583333336 | 32.38 |
| 44847.125 | 32.37 |
| 44847.135416666664 | 32.37 |
| 44847.145833333336 | 32.36 |
| 44847.15625 | 32.36 |
| 44847.166666666664 | 32.33 |
| 44847.177083333336 | 32.36 |
| 44847.1875 | 32.37 |
| 44847.197916666664 | 32.38 |
| 44847.208333333336 | 32.39 |
| 44847.21875 | 32.4 |
| 44847.229166666664 | 32.39 |
| 44847.239583333336 | 32.43 |
| 44847.25 | 32.41 |
| 44847.260416666664 | 32.39 |
| 44847.270833333336 | 32.39 |
| 44847.28125 | 32.37 |
| 44847.291666666664 | 32.34 |
| 44847.302083333336 | 32.32 |
| 44847.3125 | 32.29 |
| 44847.322916666664 | 32.25 |
| 44847.333333333336 | 32.22 |
| 44847.34375 | 32.2 |
| 44847.354166666664 | 32.18 |
| 44847.364583333336 | 32.16 |
| 44847.375 | 32.17 |
| 44847.385416666664 | 32.16 |
| 44847.395833333336 | 32.14 |
| 44847.40625 | 32.18 |
| 44847.416666666664 | 32.18 |
| 44847.427083333336 | 32.17 |
| 44847.4375 | 32.2 |
| 44847.447916666664 | 32.24 |
| 44847.458333333336 | 32.3 |
| 44847.46875 | 32.33 |
| 44847.479166666664 | 32.35 |
| 44847.489583333336 | 32.35 |
| 44847.5 | 32.36 |
| 44847.510416666664 | 32.37 |
| 44847.520833333336 | 32.39 |
| 44847.53125 | 32.39 |
| 44847.541666666664 | 32.4 |
| 44847.552083333336 | 32.4 |
| 44847.5625 | 32.41 |
| 44847.572916666664 | 32.41 |
| 44847.583333333336 | 32.41 |
| 44847.59375 | 32.4 |
| 44847.604166666664 | 32.4 |
| 44847.614583333336 | 32.38 |
| 44847.625 | 32.37 |
| 44847.635416666664 | 32.37 |
| 44847.645833333336 | 32.37 |
| 44847.65625 | 32.32 |
| 44847.666666666664 | 32.3 |
| 44847.677083333336 | 32.3 |
| 44847.6875 | 32.24 |
| 44847.697916666664 | 32.21 |
| 44847.708333333336 | 32.23 |
| 44847.71875 | 32.16 |
| 44847.729166666664 | 32.12 |
| 44847.739583333336 | 32.16 |
| 44847.75 | 32.14 |
| 44847.760416666664 | 32.13 |
| 44847.770833333336 | 32.09 |
| 44847.78125 | 32.11 |
| 44847.791666666664 | 32.08 |
| 44847.802083333336 | 32.06 |
| 44847.8125 | 32.05 |
| 44847.822916666664 | 31.97 |
| 44847.833333333336 | 32.04 |
| 44847.84375 | 32.05 |
| 44847.854166666664 | 32 |
| 44847.864583333336 | 32 |
| 44847.875 | 31.99 |
| 44847.885416666664 | 32.01 |
| 44847.895833333336 | 32.01 |
| 44847.90625 | 32 |
| 44847.916666666664 | 31.98 |
| 44847.927083333336 | 31.95 |
| 44847.9375 | 31.97 |
| 44847.947916666664 | 31.98 |
| 44847.958333333336 | 31.98 |
| 44847.96875 | 31.98 |
| 44847.979166666664 | 32 |
| 44847.989583333336 | 32.03 |
| 44848.0 | 32.06 |
| 44848.010416666664 | 32.11 |
| 44848.020833333336 | 32.13 |
| 44848.03125 | 32.12 |
| 44848.041666666664 | 32.13 |
| 44848.052083333336 | 32.13 |
| 44848.0625 | 32.12 |
| 44848.072916666664 | 32.12 |
| 44848.083333333336 | 32.13 |
| 44848.09375 | 32.13 |
| 44848.104166666664 | 32.14 |
| 44848.114583333336 | 32.15 |
| 44848.125 | 32.16 |
| 44848.135416666664 | 32.17 |
| 44848.145833333336 | 32.18 |
| 44848.15625 | 32.19 |
| 44848.166666666664 | 32.19 |
| 44848.177083333336 | 32.19 |
| 44848.1875 | 31.96 |
| 44848.197916666664 | 32.09 |
| 44848.208333333336 | 32.18 |
| 44848.21875 | 32.15 |
| 44848.229166666664 | 32.13 |
| 44848.239583333336 | 32.12 |
| 44848.25 | 32.11 |
| 44848.260416666664 | 32.1 |
| 44848.270833333336 | 32.1 |
| 44848.28125 | 32.11 |
| 44848.291666666664 | 32.1 |
| 44848.302083333336 | 32.09 |
| 44848.3125 | 32.1 |
| 44848.322916666664 | 32.1 |
| 44848.333333333336 | 32.09 |
| 44848.34375 | 32.09 |
| 44848.354166666664 | 32.08 |
| 44848.364583333336 | 32.05 |
| 44848.375 | 32.01 |
| 44848.385416666664 | 31.98 |
| 44848.395833333336 | 31.97 |
| 44848.40625 | 31.97 |
| 44848.416666666664 | 31.93 |
| 44848.427083333336 | 31.93 |
| 44848.4375 | 31.96 |
| 44848.447916666664 | 31.98 |
| 44848.458333333336 | 31.95 |
| 44848.46875 | 31.97 |
| 44848.479166666664 | 32 |
| 44848.489583333336 | 32.05 |
| 44848.5 | 32.1 |
| 44848.510416666664 | 32.14 |
| 44848.520833333336 | 32.16 |
| 44848.53125 | 32.16 |
| 44848.541666666664 | 32.18 |
| 44848.552083333336 | 32.19 |
| 44848.5625 | 32.19 |
| 44848.572916666664 | 32.21 |
| 44848.583333333336 | 32.22 |
| 44848.59375 | 32.22 |
| 44848.604166666664 | 32.24 |
| 44848.614583333336 | 32.23 |
| 44848.625 | 32.23 |
| 44848.635416666664 | 32.21 |
| 44848.645833333336 | 32.21 |
| 44848.65625 | 32.2 |
| 44848.666666666664 | 32.2 |
| 44848.677083333336 | 32.2 |
| 44848.6875 | 32.21 |
| 44848.697916666664 | 32.19 |
| 44848.708333333336 | 32.19 |
| 44848.71875 | 32.17 |
| 44848.729166666664 | 32.2 |
| 44848.739583333336 | 32.2 |
| 44848.75 | 32.23 |
| 44848.760416666664 | 32.25 |
| 44848.770833333336 | 32.23 |
| 44848.78125 | 32.24 |
| 44848.791666666664 | 32.23 |
| 44848.802083333336 | 32.21 |
| 44848.8125 | 32.24 |
| 44848.822916666664 | 32.21 |
| 44848.833333333336 | 32.2 |
| 44848.84375 | 32.23 |
| 44848.854166666664 | 32.21 |
| 44848.864583333336 | 32.21 |
| 44848.875 | 32.21 |
| 44848.885416666664 | 32.19 |
| 44848.895833333336 | 32.19 |
| 44848.90625 | 32.17 |
| 44848.916666666664 | 32.17 |
| 44848.927083333336 | 32.14 |
| 44848.9375 | 32.15 |
| 44848.947916666664 | 32.11 |
| 44848.958333333336 | 32.09 |
| 44848.96875 | 32.15 |
| 44848.979166666664 | 32.09 |
| 44848.989583333336 | 32.09 |
| 44849.0 | 32.08 |
| 44849.010416666664 | 32.11 |
| 44849.020833333336 | 32.13 |
| 44849.03125 | 32.15 |
| 44849.041666666664 | 32.18 |
| 44849.052083333336 | 32.19 |
| 44849.0625 | 32.2 |
| 44849.072916666664 | 32.21 |
| 44849.083333333336 | 32.2 |
| 44849.09375 | 32.21 |
| 44849.104166666664 | 32.21 |
| 44849.114583333336 | 32.21 |
| 44849.125 | 32.21 |
| 44849.135416666664 | 32.22 |
| 44849.145833333336 | 32.22 |
| 44849.15625 | 32.22 |
| 44849.166666666664 | 32.23 |
| 44849.177083333336 | 32.23 |
| 44849.1875 | 32.23 |
| 44849.197916666664 | 32.23 |
| 44849.208333333336 | 32.2 |
| 44849.21875 | 32.22 |
| 44849.229166666664 | 32.24 |
| 44849.239583333336 | 32.22 |
| 44849.25 | 32.28 |
| 44849.260416666664 | 32.26 |
| 44849.270833333336 | 32.23 |
| 44849.28125 | 32.23 |
| 44849.291666666664 | 32.25 |
| 44849.302083333336 | 32.24 |
| 44849.3125 | 32.23 |
| 44849.322916666664 | 32.23 |
| 44849.333333333336 | 32.21 |
| 44849.34375 | 32.19 |
| 44849.354166666664 | 32.18 |
| 44849.364583333336 | 32.14 |
| 44849.375 | 32.1 |
| 44849.385416666664 | 32.13 |
| 44849.395833333336 | 32.09 |
| 44849.40625 | 32.08 |
| 44849.416666666664 | 32.05 |
| 44849.427083333336 | 32.04 |
| 44849.4375 | 32.03 |
| 44849.447916666664 | 32.02 |
| 44849.458333333336 | 32.02 |
| 44849.46875 | 32.02 |
| 44849.479166666664 | 32.05 |
| 44849.489583333336 | 32.06 |
| 44849.5 | 32.06 |
| 44849.510416666664 | 32.07 |
| 44849.520833333336 | 32.09 |
| 44849.53125 | 32.13 |
| 44849.541666666664 | 32.16 |
| 44849.552083333336 | 32.19 |
| 44849.5625 | 32.22 |
| 44849.572916666664 | 32.21 |
| 44849.583333333336 | 32.2 |
| 44849.59375 | 32.23 |
| 44849.604166666664 | 32.24 |
| 44849.614583333336 | 32.26 |
| 44849.625 | 32.24 |
| 44849.635416666664 | 32.24 |
| 44849.645833333336 | 32.24 |
| 44849.65625 | 32.26 |
| 44849.666666666664 | 32.26 |
| 44849.677083333336 | 32.26 |
| 44849.6875 | 32.26 |
| 44849.697916666664 | 32.26 |
| 44849.708333333336 | 32.25 |
| 44849.71875 | 32.25 |
| 44849.729166666664 | 32.26 |
| 44849.739583333336 | 32.26 |
| 44849.75 | 32.25 |
| 44849.760416666664 | 32.27 |
| 44849.770833333336 | 32.29 |
| 44849.78125 | 32.29 |
| 44849.791666666664 | 32.3 |
| 44849.802083333336 | 32.32 |
| 44849.8125 | 32.28 |
| 44849.822916666664 | 32.33 |
| 44849.833333333336 | 32.31 |
| 44849.84375 | 32.32 |
| 44849.854166666664 | 32.31 |
| 44849.864583333336 | 32.32 |
| 44849.875 | 32.31 |
| 44849.885416666664 | 32.31 |
| 44849.895833333336 | 32.31 |
| 44849.90625 | 32.29 |
| 44849.916666666664 | 32.28 |
| 44849.927083333336 | 32.28 |
| 44849.9375 | 32.26 |
| 44849.947916666664 | 32.23 |
| 44849.958333333336 | 32.18 |
| 44849.96875 | 32.16 |
| 44849.979166666664 | 32.15 |
| 44849.989583333336 | 32.14 |
| 44850.0 | 32.2 |
| 44850.010416666664 | 32.19 |
| 44850.020833333336 | 32.19 |
| 44850.03125 | 32.17 |
| 44850.041666666664 | 32.18 |
| 44850.052083333336 | 32.19 |
| 44850.0625 | 32.21 |
| 44850.072916666664 | 32.24 |
| 44850.083333333336 | 32.25 |
| 44850.09375 | 32.27 |
| 44850.104166666664 | 32.28 |
| 44850.114583333336 | 32.28 |
| 44850.125 | 32.28 |
| 44850.135416666664 | 32.25 |
| 44850.145833333336 | 32.29 |
| 44850.15625 | 32.31 |
| 44850.166666666664 | 32.31 |
| 44850.177083333336 | 32.32 |
| 44850.1875 | 32.33 |
| 44850.197916666664 | 32.34 |
| 44850.208333333336 | 32.34 |
| 44850.21875 | 32.35 |
| 44850.229166666664 | 32.35 |
| 44850.239583333336 | 32.32 |
| 44850.25 | 32.31 |
| 44850.260416666664 | 32.31 |
| 44850.270833333336 | 32.32 |
| 44850.28125 | 32.35 |
| 44850.291666666664 | 32.35 |
| 44850.302083333336 | 32.34 |
| 44850.3125 | 32.34 |
| 44850.322916666664 | 32.32 |
| 44850.333333333336 | 32.36 |
| 44850.34375 | 32.33 |
| 44850.354166666664 | 32.3 |
| 44850.364583333336 | 32.28 |
| 44850.375 | 32.27 |
| 44850.385416666664 | 32.24 |
| 44850.395833333336 | 32.2 |
| 44850.40625 | 32.03 |
| 44850.416666666664 | 24.03 |
| 44850.427083333336 | 32.18 |
| 44850.4375 | 32.17 |
| 44850.447916666664 | 32.12 |
| 44850.458333333336 | 32.1 |
| 44850.46875 | 32.09 |
| 44850.479166666664 | 32.06 |
| 44850.489583333336 | 32.04 |
| 44850.5 | 32.05 |
| 44850.510416666664 | 32.03 |
| 44850.520833333336 | 32.08 |
| 44850.53125 | 32.1 |
| 44850.541666666664 | 32.09 |
| 44850.552083333336 | 32.12 |
| 44850.5625 | 32.16 |
| 44850.572916666664 | 32.2 |
| 44850.583333333336 | 32.24 |
| 44850.59375 | 32.28 |
| 44850.604166666664 | 32.31 |
| 44850.614583333336 | 32.33 |
| 44850.625 | 32.34 |
| 44850.635416666664 | 32.35 |
| 44850.645833333336 | 32.36 |
| 44850.65625 | 32.36 |
| 44850.666666666664 | 32.37 |
| 44850.677083333336 | 32.38 |
| 44850.6875 | 32.4 |
| 44850.697916666664 | 32.4 |
| 44850.708333333336 | 32.41 |
| 44850.71875 | 32.42 |
| 44850.729166666664 | 32.42 |
| 44850.739583333336 | 32.41 |
| 44850.75 | 32.41 |
| 44850.760416666664 | 32.4 |
| 44850.770833333336 | 32.25 |
| 44850.78125 | 32.41 |
| 44850.791666666664 | 32.32 |
| 44850.802083333336 | 32.44 |
| 44850.8125 | 32.43 |
| 44850.822916666664 | 32.42 |
| 44850.833333333336 | 32.41 |
| 44850.84375 | 32.41 |
| 44850.854166666664 | 32.39 |
| 44850.864583333336 | 32.4 |
| 44850.875 | 32.42 |
| 44850.885416666664 | 32.42 |
| 44850.895833333336 | 32.41 |
| 44850.90625 | 32.4 |
| 44850.916666666664 | 32.38 |
| 44850.927083333336 | 32.36 |
| 44850.9375 | 32.33 |
| 44850.947916666664 | 32.34 |
| 44850.958333333336 | 32.34 |
| 44850.96875 | 32.34 |
| 44850.979166666664 | 32.33 |
| 44850.989583333336 | 32.32 |
| 44851.0 | 32.32 |
| 44851.010416666664 | 32.27 |
| 44851.020833333336 | 32.25 |
| 44851.03125 | 32.24 |
| 44851.041666666664 | 32.24 |
| 44851.052083333336 | 32.24 |
| 44851.0625 | 32.27 |
| 44851.072916666664 | 32.27 |
| 44851.083333333336 | 32.27 |
| 44851.09375 | 32.25 |
| 44851.104166666664 | 32.26 |
| 44851.114583333336 | 32.23 |
| 44851.125 | 32.11 |
| 44851.135416666664 | 32.16 |
| 44851.145833333336 | 32.09 |
| 44851.15625 | 32.03 |
| 44851.166666666664 | 32.03 |
| 44851.177083333336 | 32 |
| 44851.1875 | 31.92 |
| 44851.197916666664 | 31.89 |
| 44851.208333333336 | 31.84 |
| 44851.21875 | 31.84 |
| 44851.229166666664 | 31.84 |
| 44851.239583333336 | 31.88 |
| 44851.25 | 31.89 |
| 44851.260416666664 | 31.79 |
| 44851.270833333336 | 31.74 |
| 44851.28125 | 31.63 |
| 44851.291666666664 | 31.76 |
| 44851.302083333336 | 31.83 |
| 44851.3125 | 30.84 |
| 44851.322916666664 | 29.11 |
| 44851.333333333336 | 26.3 |
| 44851.34375 | 30.3 |
| 44851.354166666664 | 30.95 |
| 44851.364583333336 | 30.31 |
| 44851.375 | 30.73 |
| 44851.385416666664 | 29.77 |
| 44851.395833333336 | 28.78 |
| 44851.40625 | 29.78 |
| 44851.416666666664 | 30.35 |
| 44851.427083333336 | 30.19 |
| 44851.4375 | 28.62 |
| 44851.447916666664 | 28.37 |
| 44851.458333333336 | 28.03 |
| 44851.46875 | 27.12 |
| 44851.479166666664 | 27.2 |
| 44851.489583333336 | 27.08 |
| 44851.5 | 27.35 |
| 44851.510416666664 | 27.72 |
| 44851.520833333336 | 28.23 |
| 44851.53125 | 28.36 |
| 44851.541666666664 | 28.81 |
| 44851.552083333336 | 29.29 |
| 44851.5625 | 29.59 |
| 44851.572916666664 | 29.61 |
| 44851.583333333336 | 29.7 |
| 44851.59375 | 30.02 |
| 44851.604166666664 | 30.44 |
| 44851.614583333336 | 30.66 |
| 44851.625 | 30.72 |
| 44851.635416666664 | 30.9 |
| 44851.645833333336 | 31.09 |
| 44851.65625 | 31.19 |
| 44851.666666666664 | 31.18 |
| 44851.677083333336 | 31.12 |
| 44851.6875 | 31.07 |
| 44851.697916666664 | 31.1 |
| 44851.708333333336 | 31.11 |
| 44851.71875 | 31.1 |
| 44851.729166666664 | 31.09 |
| 44851.739583333336 | 31.08 |
| 44851.75 | 31.07 |
| 44851.760416666664 | 31.08 |
| 44851.770833333336 | 31.09 |
| 44851.78125 | 31.06 |
| 44851.791666666664 | 31.06 |
| 44851.802083333336 | 30.92 |
| 44851.8125 | 30.99 |
| 44851.822916666664 | 31.02 |
| 44851.833333333336 | 30.99 |
| 44851.84375 | 31 |
| 44851.854166666664 | 30.97 |
| 44851.864583333336 | 30.94 |
| 44851.875 | 30.86 |
| 44851.885416666664 | 30.85 |
| 44851.895833333336 | 30.62 |
| 44851.90625 | 30.54 |
| 44851.916666666664 | 30.33 |
| 44851.927083333336 | 30.24 |
| 44851.9375 | 30.11 |
| 44851.947916666664 | 30.54 |
| 44851.958333333336 | 30.47 |
| 44851.96875 | 30.38 |
| 44851.979166666664 | 30.25 |
| 44851.989583333336 | 30.13 |
| 44852.0 | 30.11 |
| 44852.010416666664 | 30 |
| 44852.020833333336 | 29.89 |
| 44852.03125 | 29.82 |
| 44852.041666666664 | 29.7 |
| 44852.052083333336 | 29.63 |
| 44852.0625 | 29.56 |
| 44852.072916666664 | 29.51 |
| 44852.083333333336 | 29.53 |
| 44852.09375 | 29.65 |
| 44852.104166666664 | 29.68 |
| 44852.114583333336 | 29.72 |
| 44852.125 | 29.95 |
| 44852.135416666664 | 29.97 |
| 44852.145833333336 | 30.16 |
| 44852.15625 | 30.31 |
| 44852.166666666664 | 30.4 |
| 44852.177083333336 | 30.57 |
| 44852.1875 | 30.72 |
| 44852.197916666664 | 30.77 |
| 44852.208333333336 | 30.72 |
| 44852.21875 | 30.72 |
| 44852.229166666664 | 30.72 |
| 44852.239583333336 | 30.73 |
| 44852.25 | 30.75 |
| 44852.260416666664 | 30.76 |
| 44852.270833333336 | 30.76 |
| 44852.28125 | 30.76 |
| 44852.291666666664 | 30.77 |
| 44852.302083333336 | 30.77 |
| 44852.3125 | 30.78 |
| 44852.322916666664 | 30.57 |
| 44852.333333333336 | 30.79 |
| 44852.34375 | 30.79 |
| 44852.354166666664 | 30.77 |
| 44852.364583333336 | 30.77 |
| 44852.375 | 30.76 |
| 44852.385416666664 | 30.71 |
| 44852.395833333336 | 30.7 |
| 44852.40625 | 30.68 |
| 44852.416666666664 | 30.66 |
| 44852.427083333336 | 30.57 |
| 44852.4375 | 30.09 |
| 44852.447916666664 | 30.49 |
| 44852.458333333336 | 30.35 |
| 44852.46875 | 30.4 |
| 44852.479166666664 | 30.23 |
| 44852.489583333336 | 30.09 |
| 44852.5 | 29.86 |
| 44852.510416666664 | 29.67 |
| 44852.520833333336 | 29.61 |
| 44852.53125 | 29.54 |
| 44852.541666666664 | 29.5 |
| 44852.552083333336 | 29.46 |
| 44852.5625 | 29.5 |
| 44852.572916666664 | 29.45 |
| 44852.583333333336 | 29.6 |
| 44852.59375 | 29.65 |
| 44852.604166666664 | 29.77 |
| 44852.614583333336 | 29.85 |
| 44852.625 | 30.14 |
| 44852.635416666664 | 30.32 |
| 44852.645833333336 | 30.44 |
| 44852.65625 | 30.58 |
| 44852.666666666664 | 30.63 |
| 44852.677083333336 | 30.65 |
| 44852.6875 | 30.67 |
| 44852.697916666664 | 30.68 |
| 44852.708333333336 | 30.71 |
| 44852.71875 | 30.73 |
| 44852.729166666664 | 30.73 |
| 44852.739583333336 | 30.76 |
| 44852.75 | 30.76 |
| 44852.760416666664 | 30.77 |
| 44852.770833333336 | 30.76 |
| 44852.78125 | 30.75 |
| 44852.791666666664 | 30.76 |
| 44852.802083333336 | 30.76 |
| 44852.8125 | 30.77 |
| 44852.822916666664 | 30.77 |
| 44852.833333333336 | 30.75 |
| 44852.84375 | 30.76 |
| 44852.854166666664 | 30.74 |
| 44852.864583333336 | 30.77 |
| 44852.875 | 30.79 |
| 44852.885416666664 | 30.77 |
| 44852.895833333336 | 30.76 |
| 44852.90625 | 30.77 |
| 44852.916666666664 | 30.75 |
| 44852.927083333336 | 30.72 |
| 44852.9375 | 30.74 |
| 44852.947916666664 | 30.72 |
| 44852.958333333336 | 30.68 |
| 44852.96875 | 30.69 |
| 44852.979166666664 | 30.58 |
| 44852.989583333336 | 30.54 |
| 44853.0 | 30.47 |
| 44853.010416666664 | 30.44 |
| 44853.020833333336 | 30.35 |
| 44853.03125 | 30.33 |
| 44853.041666666664 | 30.19 |
| 44853.052083333336 | 29.98 |
| 44853.0625 | 29.85 |
| 44853.072916666664 | 29.69 |
| 44853.083333333336 | 29.56 |
| 44853.09375 | 29.49 |
| 44853.104166666664 | 29.45 |
| 44853.114583333336 | 29.5 |
| 44853.125 | 29.62 |
| 44853.135416666664 | 29.66 |
| 44853.145833333336 | 29.7 |
| 44853.15625 | 29.76 |
| 44853.166666666664 | 29.87 |
| 44853.177083333336 | 30.04 |
| 44853.1875 | 30.15 |
| 44853.197916666664 | 30.33 |
| 44853.208333333336 | 30.52 |
| 44853.21875 | 30.64 |
| 44853.229166666664 | 30.72 |
| 44853.239583333336 | 30.76 |
| 44853.25 | 30.77 |
| 44853.260416666664 | 30.78 |
| 44853.270833333336 | 30.76 |
| 44853.28125 | 30.76 |
| 44853.291666666664 | 30.76 |
| 44853.302083333336 | 30.75 |
| 44853.3125 | 30.76 |
| 44853.322916666664 | 30.76 |
| 44853.333333333336 | 30.77 |
| 44853.34375 | 30.75 |
| 44853.354166666664 | 30.77 |
| 44853.364583333336 | 30.7 |
| 44853.375 | 30.74 |
| 44853.385416666664 | 30.74 |
| 44853.395833333336 | 30.76 |
| 44853.40625 | 30.77 |
| 44853.416666666664 | 30.86 |
| 44853.427083333336 | 30.82 |
| 44853.4375 | 26.45 |
| 44853.447916666664 | 30.72 |
| 44853.458333333336 | 30.72 |
| 44853.46875 | 30.77 |
| 44853.479166666664 | 30.63 |
| 44853.489583333336 | 30.6 |
| 44853.5 | 30.37 |
| 44853.510416666664 | 30.11 |
| 44853.520833333336 | 29.96 |
| 44853.53125 | 29.69 |
| 44853.541666666664 | 29.51 |
| 44853.552083333336 | 29.34 |
| 44853.5625 | 29.22 |
| 44853.572916666664 | 29.15 |
| 44853.583333333336 | 29.13 |
| 44853.59375 | 29.08 |
| 44853.604166666664 | 29.03 |
| 44853.614583333336 | 29.07 |
| 44853.625 | 29.08 |
| 44853.635416666664 | 29.25 |
| 44853.645833333336 | 29.32 |
| 44853.65625 | 29.4 |
| 44853.666666666664 | 29.6 |
| 44853.677083333336 | 29.76 |
| 44853.6875 | 30.02 |
| 44853.697916666664 | 30.28 |
| 44853.708333333336 | 30.52 |
| 44853.71875 | 30.6 |
| 44853.729166666664 | 30.63 |
| 44853.739583333336 | 30.7 |
| 44853.75 | 30.71 |
| 44853.760416666664 | 30.73 |
| 44853.770833333336 | 30.74 |
| 44853.78125 | 30.76 |
| 44853.791666666664 | 30.77 |
| 44853.802083333336 | 30.8 |
| 44853.8125 | 30.83 |
| 44853.822916666664 | 30.85 |
| 44853.833333333336 | 30.87 |
| 44853.84375 | 30.88 |
| 44853.854166666664 | 30.91 |
| 44853.864583333336 | 30.93 |
| 44853.875 | 30.93 |
| 44853.885416666664 | 31.02 |
| 44853.895833333336 | 31.04 |
| 44853.90625 | 30.99 |
| 44853.916666666664 | 31.07 |
| 44853.927083333336 | 30.97 |
| 44853.9375 | 30.97 |
| 44853.947916666664 | 30.93 |
| 44853.958333333336 | 30.91 |
| 44853.96875 | 30.88 |
| 44853.979166666664 | 30.85 |
| 44853.989583333336 | 30.81 |
| 44854.0 | 30.82 |
| 44854.010416666664 | 30.79 |
| 44854.020833333336 | 30.69 |
| 44854.03125 | 30.62 |
| 44854.041666666664 | 30.46 |
| 44854.052083333336 | 30.14 |
| 44854.0625 | 29.77 |
| 44854.072916666664 | 29.5 |
| 44854.083333333336 | 29.24 |
| 44854.09375 | 29.17 |
| 44854.104166666664 | 29.09 |
| 44854.114583333336 | 29.02 |
| 44854.125 | 29.01 |
| 44854.135416666664 | 28.99 |
| 44854.145833333336 | 29 |
| 44854.15625 | 29.04 |
| 44854.166666666664 | 29.13 |
| 44854.177083333336 | 29.16 |
| 44854.1875 | 29.22 |
| 44854.197916666664 | 29.38 |
| 44854.208333333336 | 29.55 |
| 44854.21875 | 29.73 |
| 44854.229166666664 | 30.08 |
| 44854.239583333336 | 30.44 |
| 44854.25 | 30.59 |
| 44854.260416666664 | 30.74 |
| 44854.270833333336 | 30.83 |
| 44854.28125 | 30.89 |
| 44854.291666666664 | 30.96 |
| 44854.302083333336 | 30.99 |
| 44854.3125 | 31.02 |
| 44854.322916666664 | 31.04 |
| 44854.333333333336 | 31.05 |
| 44854.34375 | 31.06 |
| 44854.354166666664 | 31.07 |
| 44854.364583333336 | 31.06 |
| 44854.375 | 31.07 |
| 44854.385416666664 | 31.05 |
| 44854.395833333336 | 31.08 |
| 44854.40625 | 31.12 |
| 44854.416666666664 | 31.09 |
| 44854.427083333336 | 31.09 |
| 44854.4375 | 31.07 |
| 44854.447916666664 | 31.06 |
| 44854.458333333336 | 30.83 |
| 44854.46875 | 30.8 |
| 44854.479166666664 | 30.79 |
| 44854.489583333336 | 30.69 |
| 44854.5 | 30.72 |
| 44854.510416666664 | 30.6 |
| 44854.520833333336 | 30.57 |
| 44854.53125 | 30.33 |
| 44854.541666666664 | 30 |
| 44854.552083333336 | 29.7 |
| 44854.5625 | 29.52 |
| 44854.572916666664 | 29.36 |
| 44854.583333333336 | 29.28 |
| 44854.59375 | 29.22 |
| 44854.604166666664 | 29.15 |
| 44854.614583333336 | 29.13 |
| 44854.625 | 29.12 |
| 44854.635416666664 | 29.13 |
| 44854.645833333336 | 29.17 |
| 44854.65625 | 29.2 |
| 44854.666666666664 | 29.26 |
| 44854.677083333336 | 29.29 |
| 44854.6875 | 29.4 |
| 44854.697916666664 | 29.59 |
| 44854.708333333336 | 29.83 |
| 44854.71875 | 30.06 |
| 44854.729166666664 | 30.41 |
| 44854.739583333336 | 30.66 |
| 44854.75 | 30.69 |
| 44854.760416666664 | 30.73 |
| 44854.770833333336 | 30.83 |
| 44854.78125 | 30.92 |
| 44854.791666666664 | 30.92 |
| 44854.802083333336 | 30.94 |
| 44854.8125 | 31.02 |
| 44854.822916666664 | 30.99 |
| 44854.833333333336 | 31.06 |
| 44854.84375 | 31.07 |
| 44854.854166666664 | 31.06 |
| 44854.864583333336 | 31.07 |
| 44854.875 | 31.1 |
| 44854.885416666664 | 31.12 |
| 44854.895833333336 | 31.12 |
| 44854.90625 | 31.11 |
| 44854.916666666664 | 31.11 |
| 44854.927083333336 | 31.13 |
| 44854.9375 | 30.97 |
| 44854.947916666664 | 30.97 |
| 44854.958333333336 | 31.02 |
| 44854.96875 | 31.14 |
| 44854.979166666664 | 31.08 |
| 44854.989583333336 | 31.08 |
| 44855.0 | 30.96 |
| 44855.010416666664 | 30.97 |
| 44855.020833333336 | 30.96 |
| 44855.03125 | 30.91 |
| 44855.041666666664 | 30.9 |
| 44855.052083333336 | 30.9 |
| 44855.0625 | 30.74 |
| 44855.072916666664 | 30.52 |
| 44855.083333333336 | 30.09 |
| 44855.09375 | 29.83 |
| 44855.104166666664 | 29.64 |
| 44855.114583333336 | 29.55 |
| 44855.125 | 29.51 |
| 44855.135416666664 | 29.42 |
| 44855.145833333336 | 29.34 |
| 44855.15625 | 29.28 |
| 44855.166666666664 | 29.23 |
| 44855.177083333336 | 29.2 |
| 44855.1875 | 29.21 |
| 44855.197916666664 | 29.27 |
| 44855.208333333336 | 29.34 |
| 44855.21875 | 29.37 |
| 44855.229166666664 | 29.39 |
| 44855.239583333336 | 29.44 |
| 44855.25 | 29.6 |
| 44855.260416666664 | 29.74 |
| 44855.270833333336 | 30.05 |
| 44855.28125 | 30.33 |
| 44855.291666666664 | 30.51 |
| 44855.302083333336 | 30.66 |
| 44855.3125 | 30.77 |
| 44855.322916666664 | 30.85 |
| 44855.333333333336 | 30.88 |
| 44855.34375 | 30.92 |
| 44855.354166666664 | 30.93 |
| 44855.364583333336 | 30.96 |
| 44855.375 | 30.98 |
| 44855.385416666664 | 30.99 |
| 44855.395833333336 | 30.98 |
| 44855.40625 | 30.99 |
| 44855.416666666664 | 31.01 |
| 44855.427083333336 | 31.02 |
| 44855.4375 | 30.96 |
| 44855.447916666664 | 30.95 |
| 44855.458333333336 | 30.95 |
| 44855.46875 | 30.95 |
| 44855.479166666664 | 30.94 |
| 44855.489583333336 | 30.9 |
| 44855.5 | 30.86 |
| 44855.510416666664 | 30.88 |
| 44855.520833333336 | 30.79 |
| 44855.53125 | 30.73 |
| 44855.541666666664 | 30.69 |
| 44855.552083333336 | 30.9 |
| 44855.5625 | 30.46 |
| 44855.572916666664 | 30.34 |
| 44855.583333333336 | 30.12 |
| 44855.59375 | 29.9 |
| 44855.604166666664 | 29.82 |
| 44855.614583333336 | 29.68 |
| 44855.625 | 29.47 |
| 44855.635416666664 | 29.34 |
| 44855.645833333336 | 29.25 |
| 44855.65625 | 29.15 |
| 44855.666666666664 | 29.11 |
| 44855.677083333336 | 29.15 |
| 44855.6875 | 29.14 |
| 44855.697916666664 | 29.15 |
| 44855.708333333336 | 29.29 |
| 44855.71875 | 29.29 |
| 44855.729166666664 | 29.35 |
| 44855.739583333336 | 29.46 |
| 44855.75 | 29.63 |
| 44855.760416666664 | 29.72 |
| 44855.770833333336 | 29.97 |
| 44855.78125 | 30.24 |
| 44855.791666666664 | 30.44 |
| 44855.802083333336 | 30.54 |
| 44855.8125 | 30.66 |
| 44855.822916666664 | 30.82 |
| 44855.833333333336 | 30.78 |
| 44855.84375 | 30.91 |
| 44855.854166666664 | 30.88 |
| 44855.864583333336 | 30.95 |
| 44855.875 | 30.95 |
| 44855.885416666664 | 30.97 |
| 44855.895833333336 | 30.95 |
| 44855.90625 | 30.94 |
| 44855.916666666664 | 30.97 |
| 44855.927083333336 | 30.97 |
| 44855.9375 | 30.99 |
| 44855.947916666664 | 31.01 |
| 44855.958333333336 | 31.01 |
| 44855.96875 | 31.03 |
| 44855.979166666664 | 30.96 |
| 44855.989583333336 | 30.97 |
| 44856.0 | 30.95 |
| 44856.010416666664 | 30.93 |
| 44856.020833333336 | 30.94 |
| 44856.03125 | 30.9 |
| 44856.041666666664 | 30.85 |
| 44856.052083333336 | 30.83 |
| 44856.0625 | 30.81 |
| 44856.072916666664 | 30.79 |
| 44856.083333333336 | 30.76 |
| 44856.09375 | 30.73 |
| 44856.104166666664 | 30.61 |
| 44856.114583333336 | 30.56 |
| 44856.125 | 30.32 |
| 44856.135416666664 | 30.29 |
| 44856.145833333336 | 30.09 |
| 44856.15625 | 29.94 |
| 44856.166666666664 | 29.87 |
| 44856.177083333336 | 29.79 |
| 44856.1875 | 29.76 |
| 44856.197916666664 | 29.74 |
| 44856.208333333336 | 29.78 |
| 44856.21875 | 29.85 |
| 44856.229166666664 | 29.91 |
| 44856.239583333336 | 29.94 |
| 44856.25 | 29.98 |
| 44856.260416666664 | 30.05 |
| 44856.270833333336 | 30.17 |
| 44856.28125 | 30.31 |
| 44856.291666666664 | 30.48 |
| 44856.302083333336 | 30.66 |
| 44856.3125 | 30.82 |
| 44856.322916666664 | 30.88 |
| 44856.333333333336 | 30.92 |
| 44856.34375 | 30.94 |
| 44856.354166666664 | 30.96 |
| 44856.364583333336 | 30.98 |
| 44856.375 | 30.98 |
| 44856.385416666664 | 30.99 |
| 44856.395833333336 | 30.99 |
| 44856.40625 | 30.99 |
| 44856.416666666664 | 30.99 |
| 44856.427083333336 | 30.98 |
| 44856.4375 | 30.99 |
| 44856.447916666664 | 30.99 |
| 44856.458333333336 | 31.01 |
| 44856.46875 | 31 |
| 44856.479166666664 | 31.03 |
| 44856.489583333336 | 31.02 |
| 44856.5 | 30.99 |
| 44856.510416666664 | 30.99 |
| 44856.520833333336 | 30.96 |
| 44856.53125 | 30.92 |
| 44856.541666666664 | 30.92 |
| 44856.552083333336 | 30.95 |
| 44856.5625 | 30.9 |
| 44856.572916666664 | 30.83 |
| 44856.583333333336 | 30.82 |
| 44856.59375 | 30.73 |
| 44856.604166666664 | 30.78 |
| 44856.614583333336 | 30.74 |
| 44856.625 | 30.64 |
| 44856.635416666664 | 30.54 |
| 44856.645833333336 | 30.44 |
| 44856.65625 | 30.3 |
| 44856.666666666664 | 30.14 |
| 44856.677083333336 | 30.1 |
| 44856.6875 | 29.99 |
| 44856.697916666664 | 29.98 |
| 44856.708333333336 | 29.95 |
| 44856.71875 | 29.89 |
| 44856.729166666664 | 29.89 |
| 44856.739583333336 | 29.95 |
| 44856.75 | 29.98 |
| 44856.760416666664 | 29.97 |
| 44856.770833333336 | 29.99 |
| 44856.78125 | 30.06 |
| 44856.791666666664 | 30.17 |
| 44856.802083333336 | 30.28 |
| 44856.8125 | 30.44 |
| 44856.822916666664 | 30.52 |
| 44856.833333333336 | 30.66 |
| 44856.84375 | 30.77 |
| 44856.854166666664 | 30.86 |
| 44856.864583333336 | 30.92 |
| 44856.875 | 30.98 |
| 44856.885416666664 | 30.99 |
| 44856.895833333336 | 30.99 |
| 44856.90625 | 31.02 |
| 44856.916666666664 | 31.01 |
| 44856.927083333336 | 31.01 |
| 44856.9375 | 31.02 |
| 44856.947916666664 | 31.03 |
| 44856.958333333336 | 31.05 |
| 44856.96875 | 31.05 |
| 44856.979166666664 | 31.09 |
| 44856.989583333336 | 31.06 |
| 44857.0 | 31.09 |
| 44857.010416666664 | 31.09 |
| 44857.020833333336 | 31.06 |
| 44857.03125 | 31.05 |
| 44857.041666666664 | 31.04 |
| 44857.052083333336 | 31.04 |
| 44857.0625 | 30.97 |
| 44857.072916666664 | 30.97 |
| 44857.083333333336 | 30.93 |
| 44857.09375 | 30.92 |
| 44857.104166666664 | 30.9 |
| 44857.114583333336 | 30.9 |
| 44857.125 | 30.89 |
| 44857.135416666664 | 30.87 |
| 44857.145833333336 | 30.85 |
| 44857.15625 | 30.79 |
| 44857.166666666664 | 30.68 |
| 44857.177083333336 | 30.61 |
| 44857.1875 | 30.51 |
| 44857.197916666664 | 30.46 |
| 44857.208333333336 | 30.4 |
| 44857.21875 | 30.37 |
| 44857.229166666664 | 30.34 |
| 44857.239583333336 | 30.18 |
| 44857.25 | 30.38 |
| 44857.260416666664 | 30.42 |
| 44857.270833333336 | 30.4 |
| 44857.28125 | 30.44 |
| 44857.291666666664 | 30.26 |
| 44857.302083333336 | 30.13 |
| 44857.3125 | 29.16 |
| 44857.322916666664 | 30.89 |
| 44857.333333333336 | 30.99 |
| 44857.34375 | 31.03 |
| 44857.354166666664 | 31.01 |
| 44857.364583333336 | 31.05 |
| 44857.375 | 31.1 |
| 44857.385416666664 | 31.11 |
| 44857.395833333336 | 31.12 |
| 44857.40625 | 31.11 |
| 44857.416666666664 | 31.11 |
| 44857.427083333336 | 31.11 |
| 44857.4375 | 31.12 |
| 44857.447916666664 | 31.13 |
| 44857.458333333336 | 31.16 |
| 44857.46875 | 31.18 |
| 44857.479166666664 | 31.2 |
| 44857.489583333336 | 31.22 |
| 44857.5 | 31.24 |
| 44857.510416666664 | 31.24 |
| 44857.520833333336 | 31.19 |
| 44857.53125 | 31.18 |
| 44857.541666666664 | 31.21 |
| 44857.552083333336 | 31.18 |
| 44857.5625 | 31.16 |
| 44857.572916666664 | 31.15 |
| 44857.583333333336 | 31.13 |
| 44857.59375 | 31.12 |
| 44857.604166666664 | 31.1 |
| 44857.614583333336 | 31.09 |
| 44857.625 | 31.05 |
| 44857.635416666664 | 31.05 |
| 44857.645833333336 | 31.02 |
| 44857.65625 | 31.02 |
| 44857.666666666664 | 30.99 |
| 44857.677083333336 | 30.96 |
| 44857.6875 | 30.99 |
| 44857.697916666664 | 30.93 |
| 44857.708333333336 | 30.89 |
| 44857.71875 | 30.84 |
| 44857.729166666664 | 30.77 |
| 44857.739583333336 | 30.7 |
| 44857.75 | 30.6 |
| 44857.760416666664 | 30.55 |
| 44857.770833333336 | 30.54 |
| 44857.78125 | 30.55 |
| 44857.791666666664 | 30.43 |
| 44857.802083333336 | 30.48 |
| 44857.8125 | 30.52 |
| 44857.822916666664 | 30.53 |
| 44857.833333333336 | 30.56 |
| 44857.84375 | 30.57 |
| 44857.854166666664 | 30.55 |
| 44857.864583333336 | 30.62 |
| 44857.875 | 30.62 |
| 44857.885416666664 | 30.65 |
| 44857.895833333336 | 30.68 |
| 44857.90625 | 30.71 |
| 44857.916666666664 | 30.73 |
| 44857.927083333336 | 30.76 |
| 44857.9375 | 30.78 |
| 44857.947916666664 | 30.79 |
| 44857.958333333336 | 30.79 |
| 44857.96875 | 30.81 |
| 44857.979166666664 | 30.82 |
| 44857.989583333336 | 30.83 |
| 44858.0 | 30.85 |
| 44858.010416666664 | 30.86 |
| 44858.020833333336 | 30.88 |
| 44858.03125 | 30.85 |
| 44858.041666666664 | 30.82 |
| 44858.052083333336 | 30.73 |
| 44858.0625 | 30.76 |
| 44858.072916666664 | 30.71 |
| 44858.083333333336 | 30.74 |
| 44858.09375 | 30.67 |
| 44858.104166666664 | 30.68 |
| 44858.114583333336 | 30.63 |
| 44858.125 | 30.54 |
| 44858.135416666664 | 30.47 |
| 44858.145833333336 | 30.44 |
| 44858.15625 | 30.39 |
| 44858.166666666664 | 30.34 |
| 44858.177083333336 | 30.31 |
| 44858.1875 | 30.32 |
| 44858.197916666664 | 30.3 |
| 44858.208333333336 | 30.28 |
| 44858.21875 | 30.24 |
| 44858.229166666664 | 30.2 |
| 44858.239583333336 | 30.12 |
| 44858.25 | 30.08 |
| 44858.260416666664 | 30.05 |
| 44858.270833333336 | 30.01 |
| 44858.28125 | 30 |
| 44858.291666666664 | 29.98 |
| 44858.302083333336 | 30.06 |
| 44858.3125 | 30.04 |
| 44858.322916666664 | 30.04 |
| 44858.333333333336 | 30.1 |
| 44858.34375 | 30.16 |
| 44858.354166666664 | 30.34 |
| 44858.364583333336 | 30.52 |
| 44858.375 | 30.63 |
| 44858.385416666664 | 30.63 |
| 44858.395833333336 | 30.63 |
| 44858.40625 | 30.6 |
| 44858.416666666664 | 30.58 |
| 44858.427083333336 | 30.6 |
| 44858.4375 | 30.65 |
| 44858.447916666664 | 30.68 |
| 44858.458333333336 | 30.69 |
| 44858.46875 | 30.73 |
| 44858.479166666664 | 30.79 |
| 44858.489583333336 | 30.86 |
| 44858.5 | 30.97 |
| 44858.510416666664 | 31.01 |
| 44858.520833333336 | 31.03 |
| 44858.53125 | 31.03 |
| 44858.541666666664 | 30.97 |
| 44858.552083333336 | 30.96 |
| 44858.5625 | 31.01 |
| 44858.572916666664 | 30.98 |
| 44858.583333333336 | 30.91 |
| 44858.59375 | 30.89 |
| 44858.604166666664 | 30.83 |
| 44858.614583333336 | 30.82 |
| 44858.625 | 30.8 |
| 44858.635416666664 | 30.69 |
| 44858.645833333336 | 30.63 |
| 44858.65625 | 30.6 |
| 44858.666666666664 | 30.56 |
| 44858.677083333336 | 30.58 |
| 44858.6875 | 30.57 |
| 44858.697916666664 | 30.54 |
| 44858.708333333336 | 30.55 |
| 44858.71875 | 30.49 |
| 44858.729166666664 | 30.46 |
| 44858.739583333336 | 30.4 |
| 44858.75 | 14.69 |
| 44858.760416666664 | 30.13 |
| 44858.770833333336 | 29.88 |
| 44858.78125 | 29.89 |
| 44858.791666666664 | 29.74 |
| 44858.802083333336 | 29.69 |
| 44858.8125 | 29.86 |
| 44858.822916666664 | 29.88 |
| 44858.833333333336 | 29.91 |
| 44858.84375 | 30.01 |
| 44858.854166666664 | 30.11 |
| 44858.864583333336 | 30.33 |
| 44858.875 | 30.55 |
| 44858.885416666664 | 30.63 |
| 44858.895833333336 | 30.67 |
| 44858.90625 | 30.67 |
| 44858.916666666664 | 30.68 |
| 44858.927083333336 | 30.77 |
| 44858.9375 | 30.76 |
| 44858.947916666664 | 30.75 |
| 44858.958333333336 | 30.79 |
| 44858.96875 | 30.81 |
| 44858.979166666664 | 30.87 |
| 44858.989583333336 | 30.94 |
| 44859.0 | 30.99 |
| 44859.010416666664 | 31.02 |
| 44859.020833333336 | 31.04 |
| 44859.03125 | 31.06 |
| 44859.041666666664 | 31.08 |
| 44859.052083333336 | 31.03 |
| 44859.0625 | 31.04 |
| 44859.072916666664 | 31.05 |
| 44859.083333333336 | 30.98 |
| 44859.09375 | 30.92 |
| 44859.104166666664 | 30.96 |
| 44859.114583333336 | 30.95 |
| 44859.125 | 30.89 |
| 44859.135416666664 | 30.89 |
| 44859.145833333336 | 30.84 |
| 44859.15625 | 30.77 |
| 44859.166666666664 | 30.66 |
| 44859.177083333336 | 30.65 |
| 44859.1875 | 30.59 |
| 44859.197916666664 | 30.55 |
| 44859.208333333336 | 30.54 |
| 44859.21875 | 30.36 |
| 44859.229166666664 | 30.22 |
| 44859.239583333336 | 30.05 |
| 44859.25 | 30.03 |
| 44859.260416666664 | 29.73 |
| 44859.270833333336 | 29.66 |
| 44859.28125 | 29.81 |
| 44859.291666666664 | 29.77 |
| 44859.302083333336 | 29.8 |
| 44859.3125 | 29.88 |
| 44859.322916666664 | 29.86 |
| 44859.333333333336 | 29.92 |
| 44859.34375 | 30.04 |
| 44859.354166666664 | 30.16 |
| 44859.364583333336 | 30.38 |
| 44859.375 | 30.61 |
| 44859.385416666664 | 30.67 |
| 44859.395833333336 | 30.71 |
| 44859.40625 | 30.74 |
| 44859.416666666664 | 30.8 |
| 44859.427083333336 | 30.79 |
| 44859.4375 | 30.75 |
| 44859.447916666664 | 30.79 |
| 44859.458333333336 | 30.93 |
| 44859.46875 | 30.96 |
| 44859.479166666664 | 30.97 |
| 44859.489583333336 | 30.99 |
| 44859.5 | 31.02 |
| 44859.510416666664 | 31.02 |
| 44859.520833333336 | 31.11 |
| 44859.53125 | 31.12 |
| 44859.541666666664 | 31.12 |
| 44859.552083333336 | 31.11 |
| 44859.5625 | 31.08 |
| 44859.572916666664 | 31.08 |
| 44859.583333333336 | 30.97 |
| 44859.59375 | 31.09 |
| 44859.604166666664 | 31.04 |
| 44859.614583333336 | 31.02 |
| 44859.625 | 31 |
| 44859.635416666664 | 31.06 |
| 44859.645833333336 | 31.03 |
| 44859.65625 | 31 |
| 44859.666666666664 | 30.93 |
| 44859.677083333336 | 30.96 |
| 44859.6875 | 30.97 |
| 44859.697916666664 | 30.88 |
| 44859.708333333336 | 30.86 |
| 44859.71875 | 30.82 |
| 44859.729166666664 | 30.72 |
| 44859.739583333336 | 30.71 |
| 44859.75 | 30.64 |
| 44859.760416666664 | 30.54 |
| 44859.770833333336 | 30.38 |
| 44859.78125 | 30.28 |
| 44859.791666666664 | 30.18 |
| 44859.802083333336 | 30 |
| 44859.8125 | 29.89 |
| 44859.822916666664 | 29.88 |
| 44859.833333333336 | 30.01 |
| 44859.84375 | 30.04 |
| 44859.854166666664 | 30.03 |
| 44859.864583333336 | 30.13 |
| 44859.875 | 30.26 |
| 44859.885416666664 | 30.31 |
| 44859.895833333336 | 30.51 |
| 44859.90625 | 30.73 |
| 44859.916666666664 | 30.72 |
| 44859.927083333336 | 30.83 |
| 44859.9375 | 30.83 |
| 44859.947916666664 | 30.86 |
| 44859.958333333336 | 30.87 |
| 44859.96875 | 30.87 |
| 44859.979166666664 | 30.9 |
| 44859.989583333336 | 30.96 |
| 44860.0 | 31 |
| 44860.010416666664 | 31 |
| 44860.020833333336 | 31.04 |
| 44860.03125 | 31.02 |
| 44860.041666666664 | 31.05 |
| 44860.052083333336 | 31.09 |
| 44860.0625 | 31.07 |
| 44860.072916666664 | 31.1 |
| 44860.083333333336 | 31.03 |
| 44860.09375 | 30.97 |
| 44860.104166666664 | 31.03 |
| 44860.114583333336 | 31 |
| 44860.125 | 31.06 |
| 44860.135416666664 | 31.01 |
| 44860.145833333336 | 31.01 |
| 44860.15625 | 30.97 |
| 44860.166666666664 | 30.94 |
| 44860.177083333336 | 30.88 |
| 44860.1875 | 30.87 |
| 44860.197916666664 | 30.82 |
| 44860.208333333336 | 30.8 |
| 44860.21875 | 30.78 |
| 44860.229166666664 | 30.74 |
| 44860.239583333336 | 30.57 |
| 44860.25 | 30.37 |
| 44860.260416666664 | 30.4 |
| 44860.270833333336 | 30.32 |
| 44860.28125 | 30.25 |
| 44860.291666666664 | 30.2 |
| 44860.302083333336 | 30.11 |
| 44860.3125 | 30.09 |
| 44860.322916666664 | 30.06 |
| 44860.333333333336 | 30.18 |
| 44860.34375 | 30.16 |
| 44860.354166666664 | 30.21 |
| 44860.364583333336 | 30.27 |
| 44860.375 | 30.4 |
| 44860.385416666664 | 30.57 |
| 44860.395833333336 | 30.75 |
| 44860.40625 | 30.8 |
| 44860.416666666664 | 30.86 |
| 44860.427083333336 | 30.92 |
| 44860.4375 | 30.95 |
| 44860.447916666664 | 30.97 |
| 44860.458333333336 | 30.99 |
| 44860.46875 | 31.03 |
| 44860.479166666664 | 31.06 |
| 44860.489583333336 | 31.09 |
| 44860.5 | 31.12 |
| 44860.510416666664 | 31.14 |
| 44860.520833333336 | 31.16 |
| 44860.53125 | 31.17 |
| 44860.541666666664 | 31.16 |
| 44860.552083333336 | 31.15 |
| 44860.5625 | 31.09 |
| 44860.572916666664 | 31.13 |
| 44860.583333333336 | 31.13 |
| 44860.59375 | 31.13 |
| 44860.604166666664 | 31.13 |
| 44860.614583333336 | 31.08 |
| 44860.625 | 31.09 |
| 44860.635416666664 | 31.11 |
| 44860.645833333336 | 31.1 |
| 44860.65625 | 31.08 |
| 44860.666666666664 | 31.09 |
| 44860.677083333336 | 31.09 |
| 44860.6875 | 31 |
| 44860.697916666664 | 31.06 |
| 44860.708333333336 | 30.99 |
| 44860.71875 | 30.99 |
| 44860.729166666664 | 30.98 |
| 44860.739583333336 | 30.97 |
| 44860.75 | 30.95 |
| 44860.760416666664 | 30.92 |
| 44860.770833333336 | 30.9 |
| 44860.78125 | 30.89 |
| 44860.791666666664 | 30.84 |
| 44860.802083333336 | 30.77 |
| 44860.8125 | 30.67 |
| 44860.822916666664 | 30.44 |
| 44860.833333333336 | 30.36 |
| 44860.84375 | 30.25 |
| 44860.854166666664 | 30.2 |
| 44860.864583333336 | 30.25 |
| 44860.875 | 30.36 |
| 44860.885416666664 | 30.36 |
| 44860.895833333336 | 30.45 |
| 44860.90625 | 30.6 |
| 44860.916666666664 | 30.68 |
| 44860.927083333336 | 30.81 |
| 44860.9375 | 30.96 |
| 44860.947916666664 | 31.01 |
| 44860.958333333336 | 31.03 |
| 44860.96875 | 31.05 |
| 44860.979166666664 | 31.06 |
| 44860.989583333336 | 31.07 |
| 44861.0 | 31.08 |
| 44861.010416666664 | 31.08 |
| 44861.020833333336 | 31.08 |
| 44861.03125 | 31.06 |
| 44861.041666666664 | 24.73 |
| 44861.052083333336 | 31.15 |
| 44861.0625 | 31.16 |
| 44861.072916666664 | 31.19 |
| 44861.083333333336 | 31.2 |
| 44861.09375 | 31.22 |
| 44861.104166666664 | 31.2 |
| 44861.114583333336 | 31.19 |
| 44861.125 | 31.15 |
| 44861.135416666664 | 31.16 |
| 44861.145833333336 | 31.14 |
| 44861.15625 | 31.14 |
| 44861.166666666664 | 31.11 |
| 44861.177083333336 | 31.08 |
| 44861.1875 | 31.08 |
| 44861.197916666664 | 30.99 |
| 44861.208333333336 | 30.98 |
| 44861.21875 | 30.95 |
| 44861.229166666664 | 30.96 |
| 44861.239583333336 | 30.92 |
| 44861.25 | 30.92 |
| 44861.260416666664 | 28.12 |
| 44861.270833333336 | 30.8 |
| 44861.28125 | 28.44 |
| 44861.291666666664 | 26.74 |
| 44861.302083333336 | 23.84 |
| 44861.3125 | 20.57 |
| 44861.322916666664 | 30.42 |
| 44861.333333333336 | 30.39 |
| 44861.34375 | 30.39 |
| 44861.354166666664 | 30.35 |
| 44861.364583333336 | 30.43 |
| 44861.375 | 30.44 |
| 44861.385416666664 | 30.44 |
| 44861.395833333336 | 30.49 |
| 44861.40625 | 30.58 |
| 44861.416666666664 | 30.76 |
| 44861.427083333336 | 30.93 |
| 44861.4375 | 31.03 |
| 44861.447916666664 | 31.09 |
| 44861.458333333336 | 31.1 |
| 44861.46875 | 31.13 |
| 44861.479166666664 | 31.17 |
| 44861.489583333336 | 31.2 |
| 44861.5 | 31.21 |
| 44861.510416666664 | 31.23 |
| 44861.520833333336 | 31.27 |
| 44861.53125 | 31.29 |
| 44861.541666666664 | 31.32 |
| 44861.552083333336 | 31.35 |
| 44861.5625 | 31.37 |
| 44861.572916666664 | 31.37 |
| 44861.583333333336 | 31.39 |
| 44861.59375 | 31.38 |
| 44861.604166666664 | 31.37 |
| 44861.614583333336 | 31.36 |
| 44861.625 | 31.35 |
| 44861.635416666664 | 31.34 |
| 44861.645833333336 | 31.29 |
| 44861.65625 | 31.34 |
| 44861.666666666664 | 31.34 |
| 44861.677083333336 | 31.33 |
| 44861.6875 | 31.32 |
| 44861.697916666664 | 31.32 |
| 44861.708333333336 | 31.31 |
| 44861.71875 | 31.32 |
| 44861.729166666664 | 31.31 |
| 44861.739583333336 | 31.28 |
| 44861.75 | 31.27 |
| 44861.760416666664 | 31.26 |
| 44861.770833333336 | 31.25 |
| 44861.78125 | 31.24 |
| 44861.791666666664 | 31.2 |
| 44861.802083333336 | 31.2 |
| 44861.8125 | 31.19 |
| 44861.822916666664 | 31.12 |
| 44861.833333333336 | 31.05 |
| 44861.84375 | 31.01 |
| 44861.854166666664 | 30.94 |
| 44861.864583333336 | 30.81 |
| 44861.875 | 30.66 |
| 44861.885416666664 | 30.56 |
| 44861.895833333336 | 30.52 |
| 44861.90625 | 30.66 |
| 44861.916666666664 | 30.65 |
| 44861.927083333336 | 30.68 |
| 44861.9375 | 30.77 |
| 44861.947916666664 | 30.86 |
| 44861.958333333336 | 31.03 |
| 44861.96875 | 31.15 |
| 44861.979166666664 | 31.2 |
| 44861.989583333336 | 31.23 |
| 44862.0 | 31.26 |
| 44862.010416666664 | 31.28 |
| 44862.020833333336 | 31.3 |
| 44862.03125 | 31.31 |
| 44862.041666666664 | 31.33 |
| 44862.052083333336 | 31.13 |
| 44862.0625 | 22.6 |
| 44862.072916666664 | 31.37 |
| 44862.083333333336 | 31.39 |
| 44862.09375 | 31.4 |
| 44862.104166666664 | 24.45 |
| 44862.114583333336 | 31.42 |
| 44862.125 | 31.43 |
| 44862.135416666664 | 31.38 |
| 44862.145833333336 | 31.36 |
| 44862.15625 | 31.39 |
| 44862.166666666664 | 31.39 |
| 44862.177083333336 | 31.38 |
| 44862.1875 | 31.36 |
| 44862.197916666664 | 31.31 |
| 44862.208333333336 | 31.34 |
| 44862.21875 | 31.33 |
| 44862.229166666664 | 31.31 |
| 44862.239583333336 | 31.28 |
| 44862.25 | 31.32 |
| 44862.260416666664 | 31.33 |
| 44862.270833333336 | 31.27 |
| 44862.28125 | 31.27 |
| 44862.291666666664 | 31.26 |
| 44862.302083333336 | 31.17 |
| 44862.3125 | 31.1 |
| 44862.322916666664 | 30.98 |
| 44862.333333333336 | 30.88 |
| 44862.34375 | 30.83 |
| 44862.354166666664 | 30.78 |
| 44862.364583333336 | 30.75 |
| 44862.375 | 30.75 |
| 44862.385416666664 | 30.82 |
| 44862.395833333336 | 30.82 |
| 44862.40625 | 30.81 |
| 44862.416666666664 | 30.87 |
| 44862.427083333336 | 30.97 |
| 44862.4375 | 31.04 |
| 44862.447916666664 | 31.17 |
| 44862.458333333336 | 31.25 |
| 44862.46875 | 31.3 |
| 44862.479166666664 | 31.34 |
| 44862.489583333336 | 31.36 |
| 44862.5 | 31.39 |
| 44862.510416666664 | 31.4 |
| 44862.520833333336 | 31.39 |
| 44862.53125 | 31.43 |
| 44862.541666666664 | 31.44 |
| 44862.552083333336 | 31.5 |
| 44862.5625 | 31.5 |
| 44862.572916666664 | 31.53 |
| 44862.583333333336 | 31.56 |
| 44862.59375 | 31.59 |
| 44862.604166666664 | 31.58 |
| 44862.614583333336 | 31.58 |
| 44862.625 | 31.57 |
| 44862.635416666664 | 31.56 |
| 44862.645833333336 | 31.56 |
| 44862.65625 | 31.49 |
| 44862.666666666664 | 29.71 |
| 44862.677083333336 | 31.22 |
| 44862.6875 | 31.43 |
| 44862.697916666664 | 31.44 |
| 44862.708333333336 | 31.44 |
| 44862.71875 | 31.43 |
| 44862.729166666664 | 31.45 |
| 44862.739583333336 | 31.47 |
| 44862.75 | 31.43 |
| 44862.760416666664 | 31.44 |
| 44862.770833333336 | 31.45 |
| 44862.78125 | 31.46 |
| 44862.791666666664 | 31.49 |
| 44862.802083333336 | 31.49 |
| 44862.8125 | 31.46 |
| 44862.822916666664 | 31.51 |
| 44862.833333333336 | 31.44 |
| 44862.84375 | 31.48 |
| 44862.854166666664 | 31.47 |
| 44862.864583333336 | 31.43 |
| 44862.875 | 31.42 |
| 44862.885416666664 | 31.4 |
| 44862.895833333336 | 31.36 |
| 44862.90625 | 31.3 |
| 44862.916666666664 | 31.21 |
| 44862.927083333336 | 31.11 |
| 44862.9375 | 31.12 |
| 44862.947916666664 | 31.04 |
| 44862.958333333336 | 31.14 |
| 44862.96875 | 31.1 |
| 44862.979166666664 | 31.09 |
| 44862.989583333336 | 31.11 |
| 44863.0 | 31.17 |
| 44863.010416666664 | 31.26 |
| 44863.020833333336 | 31.31 |
| 44863.03125 | 31.31 |
| 44863.041666666664 | 31.39 |
| 44863.052083333336 | 31.42 |
| 44863.0625 | 31.45 |
| 44863.072916666664 | 31.47 |
| 44863.083333333336 | 31.44 |
| 44863.09375 | 31.61 |
| 44863.104166666664 | 31.62 |
| 44863.114583333336 | 31.57 |
| 44863.125 | 31.48 |
| 44863.135416666664 | 31.66 |
| 44863.145833333336 | 31.68 |
| 44863.15625 | 31.69 |
| 44863.166666666664 | 31.57 |
| 44863.177083333336 | 31.65 |
| 44863.1875 | 31.67 |
| 44863.197916666664 | 31.7 |
| 44863.208333333336 | 31.66 |
| 44863.21875 | 31.63 |
| 44863.229166666664 | 31.64 |
| 44863.239583333336 | 31.6 |
| 44863.25 | 31.54 |
| 44863.260416666664 | 31.53 |
| 44863.270833333336 | 31.51 |
| 44863.28125 | 31.46 |
| 44863.291666666664 | 31.45 |
| 44863.302083333336 | 31.4 |
| 44863.3125 | 31.38 |
| 44863.322916666664 | 31.39 |
| 44863.333333333336 | 31.2 |
| 44863.34375 | 31.39 |
| 44863.354166666664 | 31.35 |
| 44863.364583333336 | 31.37 |
| 44863.375 | 31.33 |
| 44863.385416666664 | 31.28 |
| 44863.395833333336 | 31.22 |
| 44863.40625 | 31.21 |
| 44863.416666666664 | 30.02 |
| 44863.427083333336 | 23.97 |
| 44863.4375 | 31.28 |
| 44863.447916666664 | 31.26 |
| 44863.458333333336 | 31.26 |
| 44863.46875 | 31.28 |
| 44863.479166666664 | 31.34 |
| 44863.489583333336 | 31.39 |
| 44863.5 | 31.5 |
| 44863.510416666664 | 31.6 |
| 44863.520833333336 | 31.61 |
| 44863.53125 | 31.61 |
| 44863.541666666664 | 31.63 |
| 44863.552083333336 | 31.63 |
| 44863.5625 | 31.63 |
| 44863.572916666664 | 31.63 |
| 44863.583333333336 | 31.64 |
| 44863.59375 | 31.65 |
| 44863.604166666664 | 31.67 |
| 44863.614583333336 | 31.7 |
| 44863.625 | 31.73 |
| 44863.635416666664 | 31.74 |
| 44863.645833333336 | 31.78 |
| 44863.65625 | 31.77 |
| 44863.666666666664 | 31.78 |
| 44863.677083333336 | 31.78 |
| 44863.6875 | 31.79 |
| 44863.697916666664 | 31.67 |
| 44863.708333333336 | 31.68 |
| 44863.71875 | 31.67 |
| 44863.729166666664 | 31.65 |
| 44863.739583333336 | 31.65 |
| 44863.75 | 27.91 |
| 44863.760416666664 | 27.87 |
| 44863.770833333336 | 31.62 |
| 44863.78125 | 30.68 |
| 44863.791666666664 | 31.64 |
| 44863.802083333336 | 31.69 |
| 44863.8125 | 31.67 |
| 44863.822916666664 | 31.67 |
| 44863.833333333336 | 31.64 |
| 44863.84375 | 31.67 |
| 44863.854166666664 | 31.61 |
| 44863.864583333336 | 31.62 |
| 44863.875 | 31.64 |
| 44863.885416666664 | 31.63 |
| 44863.895833333336 | 31.62 |
| 44863.90625 | 31.62 |
| 44863.916666666664 | 31.58 |
| 44863.927083333336 | 31.52 |
| 44863.9375 | 31.44 |
| 44863.947916666664 | 31.4 |
| 44863.958333333336 | 31.3 |
| 44863.96875 | 31.26 |
| 44863.979166666664 | 31.29 |
| 44863.989583333336 | 31.36 |
| 44864.0 | 31.32 |
| 44864.010416666664 | 31.31 |
| 44864.020833333336 | 31.36 |
| 44864.03125 | 31.43 |
| 44864.041666666664 | 31.45 |
| 44864.052083333336 | 31.52 |
| 44864.0625 | 31.59 |
| 44864.072916666664 | 31.65 |
| 44864.083333333336 | 31.68 |
| 44864.09375 | 31.68 |
| 44864.104166666664 | 31.68 |
| 44864.114583333336 | 31.7 |
| 44864.125 | 31.7 |
| 44864.135416666664 | 31.72 |
| 44864.145833333336 | 31.72 |
| 44864.15625 | 31.72 |
| 44864.166666666664 | 31.73 |
| 44864.177083333336 | 31.72 |
| 44864.1875 | 31.73 |
| 44864.197916666664 | 31.73 |
| 44864.208333333336 | 31.65 |
| 44864.21875 | 31.68 |
| 44864.229166666664 | 31.69 |
| 44864.239583333336 | 31.68 |
| 44864.25 | 31.67 |
| 44864.260416666664 | 31.67 |
| 44864.270833333336 | 31.65 |
| 44864.28125 | 31.66 |
| 44864.291666666664 | 31.64 |
| 44864.302083333336 | 31.66 |
| 44864.3125 | 31.62 |
| 44864.322916666664 | 31.61 |
| 44864.333333333336 | 31.58 |
| 44864.34375 | 31.58 |
| 44864.354166666664 | 31.6 |
| 44864.364583333336 | 31.61 |
| 44864.375 | 31.54 |
| 44864.385416666664 | 31.5 |
| 44864.395833333336 | 31.47 |
| 44864.40625 | 31.43 |
| 44864.416666666664 | 31.39 |
| 44864.427083333336 | 31.36 |
| 44864.4375 | 31.36 |
| 44864.447916666664 | 31.31 |
| 44864.458333333336 | 31.3 |
| 44864.46875 | 31.31 |
| 44864.479166666664 | 31.37 |
| 44864.489583333336 | 31.36 |
| 44864.5 | 29.68 |
| 44864.510416666664 | 30.76 |
| 44864.520833333336 | 31.46 |
| 44864.53125 | 31.48 |
| 44864.541666666664 | 31.57 |
| 44864.552083333336 | 31.65 |
| 44864.5625 | 31.64 |
| 44864.572916666664 | 31.65 |
| 44864.583333333336 | 31.66 |
| 44864.59375 | 31.67 |
| 44864.604166666664 | 31.67 |
| 44864.614583333336 | 31.69 |
| 44864.625 | 31.69 |
| 44864.635416666664 | 31.72 |
| 44864.645833333336 | 31.72 |
| 44864.65625 | 31.75 |
| 44864.666666666664 | 31.77 |
| 44864.677083333336 | 31.79 |
| 44864.6875 | 31.81 |
| 44864.697916666664 | 31.81 |
| 44864.708333333336 | 31.82 |
| 44864.71875 | 31.83 |
| 44864.729166666664 | 31.72 |
| 44864.739583333336 | 31.74 |
| 44864.75 | 31.67 |
| 44864.760416666664 | 31.71 |
| 44864.770833333336 | 31.76 |
| 44864.78125 | 31.73 |
| 44864.791666666664 | 31.74 |
| 44864.802083333336 | 31.79 |
| 44864.8125 | 31.78 |
| 44864.822916666664 | 31.72 |
| 44864.833333333336 | 31.72 |
| 44864.84375 | 31.7 |
| 44864.854166666664 | 31.7 |
| 44864.864583333336 | 31.69 |
| 44864.875 | 31.68 |
| 44864.885416666664 | 31.66 |
| 44864.895833333336 | 31.67 |
| 44864.90625 | 31.64 |
| 44864.916666666664 | 31.66 |
| 44864.927083333336 | 31.63 |
| 44864.9375 | 31.62 |
| 44864.947916666664 | 31.53 |
| 44864.958333333336 | 31.51 |
| 44864.96875 | 31.41 |
| 44864.979166666664 | 31.34 |
| 44864.989583333336 | 31.32 |
| 44865.0 | 31.3 |
| 44865.010416666664 | 31.31 |
| 44865.020833333336 | 31.33 |
| 44865.03125 | 31.37 |
| 44865.041666666664 | 31.36 |
| 44865.052083333336 | 31.34 |
| 44865.0625 | 31.44 |
| 44865.072916666664 | 31.52 |
| 44865.083333333336 | 31.56 |
| 44865.09375 | 31.59 |
| 44865.104166666664 | 31.66 |
| 44865.114583333336 | 31.66 |
| 44865.125 | 31.67 |
| 44865.135416666664 | 31.67 |
| 44865.145833333336 | 31.66 |
| 44865.15625 | 31.66 |
| 44865.166666666664 | 31.66 |
| 44865.177083333336 | 31.66 |
| 44865.1875 | 31.65 |
| 44865.197916666664 | 31.65 |
| 44865.208333333336 | 31.66 |
| 44865.21875 | 31.67 |
| 44865.229166666664 | 31.67 |
| 44865.239583333336 | 31.62 |
| 44865.25 | 31.61 |
| 44865.260416666664 | 31.6 |
| 44865.270833333336 | 31.61 |
| 44865.28125 | 31.62 |
| 44865.291666666664 | 31.64 |
| 44865.302083333336 | 31.66 |
| 44865.3125 | 31.63 |
| 44865.322916666664 | 31.64 |
| 44865.333333333336 | 31.64 |
| 44865.34375 | 31.69 |
| 44865.354166666664 | 31.62 |
| 44865.364583333336 | 31.62 |
| 44865.375 | 31.62 |
| 44865.385416666664 | 31.57 |
| 44865.395833333336 | 31.57 |
| 44865.40625 | 31.55 |
| 44865.416666666664 | 31.48 |
| 44865.427083333336 | 31.45 |
| 44865.4375 | 31.37 |
| 44865.447916666664 | 31.32 |
| 44865.458333333336 | 31.27 |
| 44865.46875 | 31.24 |
| 44865.479166666664 | 31.19 |
| 44865.489583333336 | 31.18 |
| 44865.5 | 31.16 |
| 44865.510416666664 | 31.23 |
| 44865.520833333336 | 31.26 |
| 44865.53125 | 31.24 |
| 44865.541666666664 | 31.27 |
| 44865.552083333336 | 31.36 |
| 44865.5625 | 28.85 |
| 44865.572916666664 | 31.52 |
| 44865.583333333336 | 31.54 |
| 44865.59375 | 31.59 |
| 44865.604166666664 | 26.54 |
| 44865.614583333336 | 31.61 |
| 44865.625 | 31.61 |
| 44865.635416666664 | 31.61 |
| 44865.645833333336 | 31.65 |
| 44865.65625 | 31.63 |
| 44865.666666666664 | 31.66 |
| 44865.677083333336 | 31.66 |
| 44865.6875 | 31.7 |
| 44865.697916666664 | 31.72 |
| 44865.708333333336 | 31.73 |
| 44865.71875 | 31.74 |
| 44865.729166666664 | 31.78 |
| 44865.739583333336 | 31.75 |
| 44865.75 | 31.76 |
| 44865.760416666664 | 31.74 |
| 44865.770833333336 | 31.73 |
| 44865.78125 | 31.63 |
| 44865.791666666664 | 31.71 |
| 44865.802083333336 | 31.76 |
| 44865.8125 | 31.76 |
| 44865.822916666664 | 31.75 |
| 44865.833333333336 | 31.71 |
| 44865.84375 | 31.57 |
| 44865.854166666664 | 31.71 |
| 44865.864583333336 | 31.66 |
| 44865.875 | 31.68 |
| 44865.885416666664 | 31.63 |
| 44865.895833333336 | 31.66 |
| 44865.90625 | 31.61 |
| 44865.916666666664 | 31.64 |
| 44865.927083333336 | 31.62 |
| 44865.9375 | 31.62 |
| 44865.947916666664 | 31.61 |
| 44865.958333333336 | 31.58 |
| 44865.96875 | 31.55 |
| 44865.979166666664 | 31.52 |
| 44865.989583333336 | 31.5 |
| 44866.0 | 31.44 |
| 44866.010416666664 | 31.4 |
| 44866.020833333336 | 31.3 |
| 44866.03125 | 31.27 |
| 44866.041666666664 | 31.23 |
| 44866.052083333336 | 31.26 |
| 44866.0625 | 31.34 |
| 44866.072916666664 | 31.33 |
| 44866.083333333336 | 31.34 |
| 44866.09375 | 31.39 |
| 44866.104166666664 | 31.47 |
| 44866.114583333336 | 31.5 |
| 44866.125 | 31.53 |
| 44866.135416666664 | 31.63 |
| 44866.145833333336 | 31.6 |